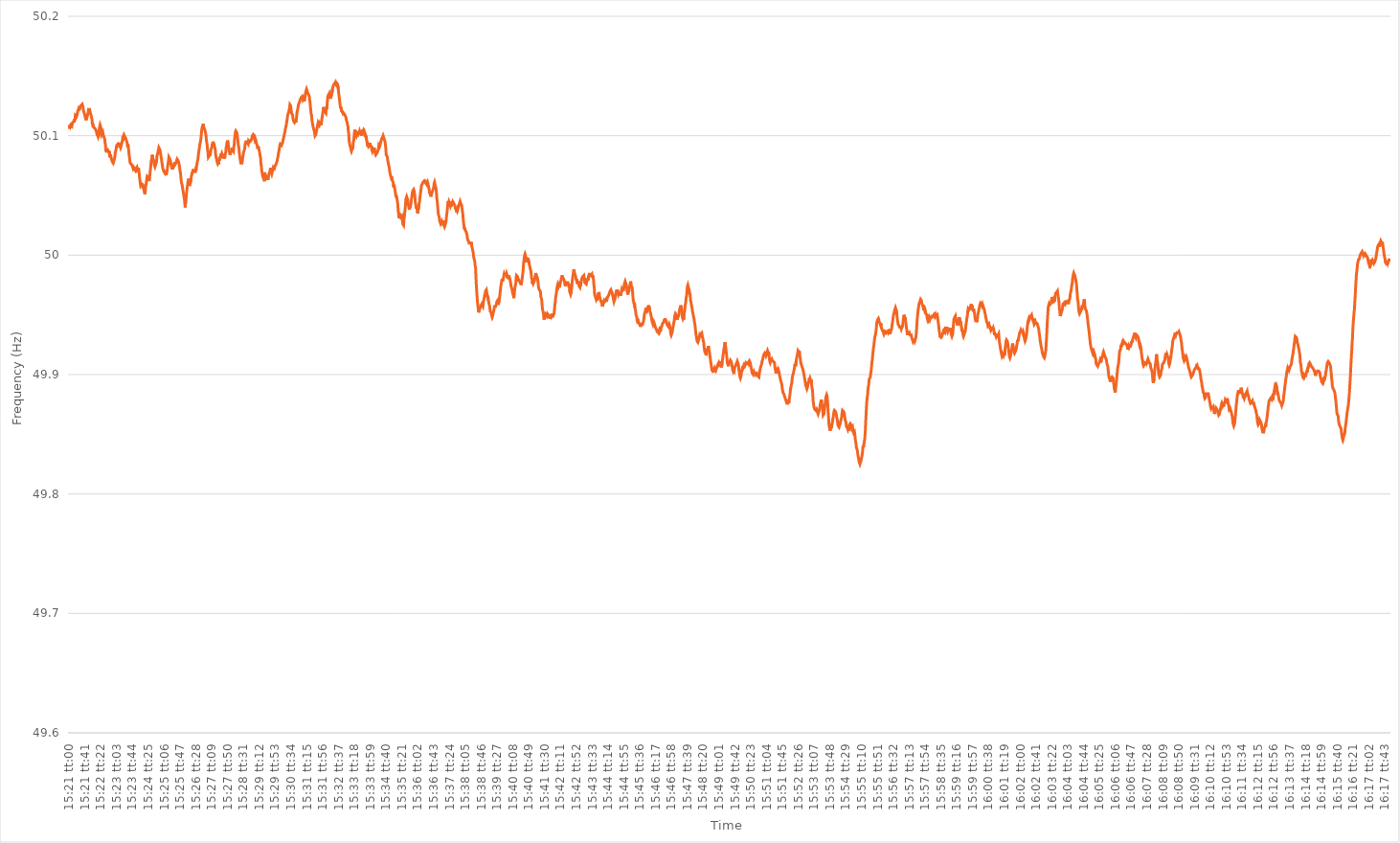
| Category | Series 0 |
|---|---|
| 0.6395833333333333 | 50.107 |
| 0.6395949074074074 | 50.106 |
| 0.6396064814814815 | 50.109 |
| 0.6396180555555556 | 50.108 |
| 0.6396296296296297 | 50.109 |
| 0.6396412037037037 | 50.109 |
| 0.6396527777777777 | 50.109 |
| 0.6396643518518519 | 50.108 |
| 0.6396759259259259 | 50.11 |
| 0.6396875 | 50.111 |
| 0.6396990740740741 | 50.111 |
| 0.6397106481481482 | 50.111 |
| 0.6397222222222222 | 50.112 |
| 0.6397337962962962 | 50.111 |
| 0.6397453703703704 | 50.114 |
| 0.6397569444444444 | 50.113 |
| 0.6397685185185186 | 50.117 |
| 0.6397800925925926 | 50.117 |
| 0.6397916666666666 | 50.117 |
| 0.6398032407407407 | 50.116 |
| 0.6398148148148148 | 50.117 |
| 0.6398263888888889 | 50.117 |
| 0.639837962962963 | 50.12 |
| 0.6398495370370371 | 50.121 |
| 0.6398611111111111 | 50.122 |
| 0.6398726851851851 | 50.121 |
| 0.6398842592592593 | 50.123 |
| 0.6398958333333333 | 50.122 |
| 0.6399074074074074 | 50.124 |
| 0.6399189814814815 | 50.124 |
| 0.6399305555555556 | 50.125 |
| 0.6399421296296296 | 50.125 |
| 0.6399537037037036 | 50.125 |
| 0.6399652777777778 | 50.126 |
| 0.6399768518518518 | 50.124 |
| 0.639988425925926 | 50.125 |
| 0.64 | 50.124 |
| 0.640011574074074 | 50.121 |
| 0.6400231481481481 | 50.121 |
| 0.6400347222222222 | 50.119 |
| 0.6400462962962963 | 50.118 |
| 0.6400578703703704 | 50.118 |
| 0.6400694444444445 | 50.115 |
| 0.6400810185185185 | 50.114 |
| 0.6400925925925925 | 50.113 |
| 0.6401041666666667 | 50.115 |
| 0.6401157407407407 | 50.115 |
| 0.6401273148148149 | 50.116 |
| 0.6401388888888889 | 50.118 |
| 0.640150462962963 | 50.119 |
| 0.640162037037037 | 50.122 |
| 0.640173611111111 | 50.122 |
| 0.6401851851851852 | 50.122 |
| 0.6401967592592592 | 50.122 |
| 0.6402083333333334 | 50.12 |
| 0.6402199074074074 | 50.12 |
| 0.6402314814814815 | 50.118 |
| 0.6402430555555555 | 50.117 |
| 0.6402546296296296 | 50.115 |
| 0.6402662037037037 | 50.114 |
| 0.6402777777777778 | 50.11 |
| 0.6402893518518519 | 50.109 |
| 0.6403009259259259 | 50.107 |
| 0.6403125 | 50.108 |
| 0.6403240740740741 | 50.107 |
| 0.6403356481481481 | 50.107 |
| 0.6403472222222223 | 50.107 |
| 0.6403587962962963 | 50.106 |
| 0.6403703703703704 | 50.106 |
| 0.6403819444444444 | 50.106 |
| 0.6403935185185184 | 50.104 |
| 0.6404050925925926 | 50.103 |
| 0.6404166666666666 | 50.101 |
| 0.6404282407407408 | 50.101 |
| 0.6404398148148148 | 50.1 |
| 0.6404513888888889 | 50.099 |
| 0.6404629629629629 | 50.1 |
| 0.640474537037037 | 50.101 |
| 0.6404861111111111 | 50.106 |
| 0.6404976851851852 | 50.106 |
| 0.6405092592592593 | 50.109 |
| 0.6405208333333333 | 50.108 |
| 0.6405324074074074 | 50.107 |
| 0.6405439814814815 | 50.104 |
| 0.6405555555555555 | 50.101 |
| 0.6405671296296297 | 50.101 |
| 0.6405787037037037 | 50.101 |
| 0.6405902777777778 | 50.103 |
| 0.6406018518518518 | 50.101 |
| 0.640613425925926 | 50.1 |
| 0.640625 | 50.099 |
| 0.640636574074074 | 50.098 |
| 0.6406481481481482 | 50.097 |
| 0.6406597222222222 | 50.094 |
| 0.6406712962962963 | 50.092 |
| 0.6406828703703703 | 50.087 |
| 0.6406944444444445 | 50.088 |
| 0.6407060185185185 | 50.086 |
| 0.6407175925925926 | 50.087 |
| 0.6407291666666667 | 50.087 |
| 0.6407407407407407 | 50.088 |
| 0.6407523148148148 | 50.088 |
| 0.6407638888888889 | 50.087 |
| 0.640775462962963 | 50.086 |
| 0.6407870370370371 | 50.087 |
| 0.6407986111111111 | 50.087 |
| 0.6408101851851852 | 50.082 |
| 0.6408217592592592 | 50.084 |
| 0.6408333333333334 | 50.082 |
| 0.6408449074074074 | 50.082 |
| 0.6408564814814816 | 50.08 |
| 0.6408680555555556 | 50.08 |
| 0.6408796296296296 | 50.078 |
| 0.6408912037037037 | 50.078 |
| 0.6409027777777777 | 50.077 |
| 0.6409143518518519 | 50.078 |
| 0.6409259259259259 | 50.079 |
| 0.6409375 | 50.079 |
| 0.6409490740740741 | 50.082 |
| 0.6409606481481481 | 50.085 |
| 0.6409722222222222 | 50.087 |
| 0.6409837962962963 | 50.088 |
| 0.6409953703703704 | 50.09 |
| 0.6410069444444445 | 50.092 |
| 0.6410185185185185 | 50.092 |
| 0.6410300925925926 | 50.092 |
| 0.6410416666666666 | 50.093 |
| 0.6410532407407408 | 50.092 |
| 0.6410648148148148 | 50.094 |
| 0.641076388888889 | 50.093 |
| 0.641087962962963 | 50.092 |
| 0.641099537037037 | 50.09 |
| 0.6411111111111111 | 50.091 |
| 0.6411226851851851 | 50.09 |
| 0.6411342592592593 | 50.09 |
| 0.6411458333333333 | 50.092 |
| 0.6411574074074075 | 50.092 |
| 0.6411689814814815 | 50.095 |
| 0.6411805555555555 | 50.096 |
| 0.6411921296296296 | 50.1 |
| 0.6412037037037037 | 50.099 |
| 0.6412152777777778 | 50.1 |
| 0.6412268518518519 | 50.099 |
| 0.641238425925926 | 50.1 |
| 0.64125 | 50.1 |
| 0.641261574074074 | 50.1 |
| 0.6412731481481482 | 50.098 |
| 0.6412847222222222 | 50.097 |
| 0.6412962962962964 | 50.096 |
| 0.6413078703703704 | 50.095 |
| 0.6413194444444444 | 50.094 |
| 0.6413310185185185 | 50.091 |
| 0.6413425925925926 | 50.093 |
| 0.6413541666666667 | 50.09 |
| 0.6413657407407407 | 50.088 |
| 0.6413773148148149 | 50.084 |
| 0.6413888888888889 | 50.082 |
| 0.6414004629629629 | 50.079 |
| 0.641412037037037 | 50.077 |
| 0.6414236111111111 | 50.077 |
| 0.6414351851851852 | 50.077 |
| 0.6414467592592593 | 50.076 |
| 0.6414583333333334 | 50.076 |
| 0.6414699074074074 | 50.075 |
| 0.6414814814814814 | 50.075 |
| 0.6414930555555556 | 50.073 |
| 0.6415046296296296 | 50.074 |
| 0.6415162037037038 | 50.074 |
| 0.6415277777777778 | 50.073 |
| 0.6415393518518518 | 50.072 |
| 0.6415509259259259 | 50.072 |
| 0.6415625 | 50.071 |
| 0.6415740740740741 | 50.072 |
| 0.6415856481481481 | 50.072 |
| 0.6415972222222223 | 50.073 |
| 0.6416087962962963 | 50.072 |
| 0.6416203703703703 | 50.073 |
| 0.6416319444444444 | 50.072 |
| 0.6416435185185185 | 50.072 |
| 0.6416550925925926 | 50.072 |
| 0.6416666666666667 | 50.072 |
| 0.6416782407407408 | 50.069 |
| 0.6416898148148148 | 50.065 |
| 0.6417013888888888 | 50.063 |
| 0.641712962962963 | 50.06 |
| 0.641724537037037 | 50.058 |
| 0.6417361111111112 | 50.058 |
| 0.6417476851851852 | 50.059 |
| 0.6417592592592593 | 50.058 |
| 0.6417708333333333 | 50.06 |
| 0.6417824074074074 | 50.058 |
| 0.6417939814814815 | 50.059 |
| 0.6418055555555555 | 50.056 |
| 0.6418171296296297 | 50.055 |
| 0.6418287037037037 | 50.054 |
| 0.6418402777777777 | 50.052 |
| 0.6418518518518518 | 50.051 |
| 0.6418634259259259 | 50.054 |
| 0.641875 | 50.058 |
| 0.6418865740740741 | 50.059 |
| 0.6418981481481482 | 50.062 |
| 0.6419097222222222 | 50.064 |
| 0.6419212962962962 | 50.066 |
| 0.6419328703703704 | 50.066 |
| 0.6419444444444444 | 50.066 |
| 0.6419560185185186 | 50.065 |
| 0.6419675925925926 | 50.063 |
| 0.6419791666666667 | 50.062 |
| 0.6419907407407407 | 50.065 |
| 0.6420023148148148 | 50.068 |
| 0.6420138888888889 | 50.071 |
| 0.642025462962963 | 50.074 |
| 0.6420370370370371 | 50.078 |
| 0.6420486111111111 | 50.08 |
| 0.6420601851851852 | 50.081 |
| 0.6420717592592592 | 50.084 |
| 0.6420833333333333 | 50.081 |
| 0.6420949074074074 | 50.081 |
| 0.6421064814814815 | 50.08 |
| 0.6421180555555556 | 50.08 |
| 0.6421296296296296 | 50.076 |
| 0.6421412037037036 | 50.075 |
| 0.6421527777777778 | 50.074 |
| 0.6421643518518518 | 50.074 |
| 0.642175925925926 | 50.074 |
| 0.6421875 | 50.077 |
| 0.6421990740740741 | 50.078 |
| 0.6422106481481481 | 50.083 |
| 0.6422222222222222 | 50.084 |
| 0.6422337962962963 | 50.085 |
| 0.6422453703703704 | 50.087 |
| 0.6422569444444445 | 50.088 |
| 0.6422685185185185 | 50.09 |
| 0.6422800925925926 | 50.09 |
| 0.6422916666666666 | 50.09 |
| 0.6423032407407407 | 50.088 |
| 0.6423148148148148 | 50.086 |
| 0.6423263888888889 | 50.086 |
| 0.642337962962963 | 50.082 |
| 0.642349537037037 | 50.08 |
| 0.642361111111111 | 50.077 |
| 0.6423726851851852 | 50.076 |
| 0.6423842592592592 | 50.073 |
| 0.6423958333333334 | 50.072 |
| 0.6424074074074074 | 50.071 |
| 0.6424189814814815 | 50.07 |
| 0.6424305555555555 | 50.07 |
| 0.6424421296296297 | 50.069 |
| 0.6424537037037037 | 50.071 |
| 0.6424652777777778 | 50.069 |
| 0.6424768518518519 | 50.068 |
| 0.6424884259259259 | 50.067 |
| 0.6425 | 50.069 |
| 0.642511574074074 | 50.07 |
| 0.6425231481481481 | 50.072 |
| 0.6425347222222222 | 50.075 |
| 0.6425462962962963 | 50.077 |
| 0.6425578703703704 | 50.079 |
| 0.6425694444444444 | 50.082 |
| 0.6425810185185185 | 50.082 |
| 0.6425925925925926 | 50.082 |
| 0.6426041666666666 | 50.08 |
| 0.6426157407407408 | 50.079 |
| 0.6426273148148148 | 50.077 |
| 0.6426388888888889 | 50.075 |
| 0.6426504629629629 | 50.074 |
| 0.6426620370370371 | 50.072 |
| 0.6426736111111111 | 50.074 |
| 0.6426851851851852 | 50.072 |
| 0.6426967592592593 | 50.075 |
| 0.6427083333333333 | 50.074 |
| 0.6427199074074074 | 50.076 |
| 0.6427314814814815 | 50.075 |
| 0.6427430555555556 | 50.078 |
| 0.6427546296296297 | 50.076 |
| 0.6427662037037037 | 50.076 |
| 0.6427777777777778 | 50.077 |
| 0.6427893518518518 | 50.078 |
| 0.6428009259259259 | 50.079 |
| 0.6428125 | 50.078 |
| 0.642824074074074 | 50.08 |
| 0.6428356481481482 | 50.08 |
| 0.6428472222222222 | 50.079 |
| 0.6428587962962963 | 50.078 |
| 0.6428703703703703 | 50.078 |
| 0.6428819444444445 | 50.075 |
| 0.6428935185185185 | 50.075 |
| 0.6429050925925927 | 50.07 |
| 0.6429166666666667 | 50.069 |
| 0.6429282407407407 | 50.065 |
| 0.6429398148148148 | 50.062 |
| 0.6429513888888889 | 50.06 |
| 0.642962962962963 | 50.059 |
| 0.6429745370370371 | 50.057 |
| 0.6429861111111111 | 50.055 |
| 0.6429976851851852 | 50.055 |
| 0.6430092592592592 | 50.051 |
| 0.6430208333333333 | 50.051 |
| 0.6430324074074074 | 50.047 |
| 0.6430439814814815 | 50.044 |
| 0.6430555555555556 | 50.04 |
| 0.6430671296296296 | 50.044 |
| 0.6430787037037037 | 50.045 |
| 0.6430902777777777 | 50.05 |
| 0.6431018518518519 | 50.053 |
| 0.6431134259259259 | 50.056 |
| 0.6431250000000001 | 50.058 |
| 0.6431365740740741 | 50.061 |
| 0.6431481481481481 | 50.062 |
| 0.6431597222222222 | 50.064 |
| 0.6431712962962963 | 50.06 |
| 0.6431828703703704 | 50.058 |
| 0.6431944444444445 | 50.059 |
| 0.6432060185185186 | 50.059 |
| 0.6432175925925926 | 50.061 |
| 0.6432291666666666 | 50.062 |
| 0.6432407407407407 | 50.066 |
| 0.6432523148148148 | 50.067 |
| 0.6432638888888889 | 50.069 |
| 0.643275462962963 | 50.069 |
| 0.643287037037037 | 50.07 |
| 0.6432986111111111 | 50.072 |
| 0.6433101851851851 | 50.07 |
| 0.6433217592592593 | 50.07 |
| 0.6433333333333333 | 50.07 |
| 0.6433449074074075 | 50.07 |
| 0.6433564814814815 | 50.069 |
| 0.6433680555555555 | 50.072 |
| 0.6433796296296296 | 50.071 |
| 0.6433912037037037 | 50.074 |
| 0.6434027777777778 | 50.075 |
| 0.6434143518518519 | 50.077 |
| 0.643425925925926 | 50.079 |
| 0.6434375 | 50.08 |
| 0.643449074074074 | 50.083 |
| 0.6434606481481482 | 50.086 |
| 0.6434722222222222 | 50.088 |
| 0.6434837962962963 | 50.09 |
| 0.6434953703703704 | 50.093 |
| 0.6435069444444445 | 50.094 |
| 0.6435185185185185 | 50.096 |
| 0.6435300925925925 | 50.098 |
| 0.6435416666666667 | 50.102 |
| 0.6435532407407407 | 50.105 |
| 0.6435648148148149 | 50.107 |
| 0.6435763888888889 | 50.108 |
| 0.643587962962963 | 50.109 |
| 0.643599537037037 | 50.11 |
| 0.6436111111111111 | 50.107 |
| 0.6436226851851852 | 50.107 |
| 0.6436342592592593 | 50.107 |
| 0.6436458333333334 | 50.105 |
| 0.6436574074074074 | 50.103 |
| 0.6436689814814814 | 50.102 |
| 0.6436805555555556 | 50.1 |
| 0.6436921296296296 | 50.096 |
| 0.6437037037037037 | 50.094 |
| 0.6437152777777778 | 50.092 |
| 0.6437268518518519 | 50.088 |
| 0.6437384259259259 | 50.086 |
| 0.6437499999999999 | 50.082 |
| 0.6437615740740741 | 50.082 |
| 0.6437731481481481 | 50.083 |
| 0.6437847222222223 | 50.083 |
| 0.6437962962962963 | 50.083 |
| 0.6438078703703703 | 50.084 |
| 0.6438194444444444 | 50.087 |
| 0.6438310185185185 | 50.089 |
| 0.6438425925925926 | 50.089 |
| 0.6438541666666667 | 50.09 |
| 0.6438657407407408 | 50.093 |
| 0.6438773148148148 | 50.092 |
| 0.6438888888888888 | 50.095 |
| 0.643900462962963 | 50.094 |
| 0.643912037037037 | 50.094 |
| 0.6439236111111112 | 50.093 |
| 0.6439351851851852 | 50.091 |
| 0.6439467592592593 | 50.09 |
| 0.6439583333333333 | 50.088 |
| 0.6439699074074073 | 50.084 |
| 0.6439814814814815 | 50.082 |
| 0.6439930555555555 | 50.081 |
| 0.6440046296296297 | 50.079 |
| 0.6440162037037037 | 50.079 |
| 0.6440277777777778 | 50.077 |
| 0.6440393518518518 | 50.078 |
| 0.6440509259259259 | 50.076 |
| 0.6440625 | 50.08 |
| 0.6440740740740741 | 50.079 |
| 0.6440856481481482 | 50.081 |
| 0.6440972222222222 | 50.082 |
| 0.6441087962962962 | 50.082 |
| 0.6441203703703704 | 50.083 |
| 0.6441319444444444 | 50.085 |
| 0.6441435185185186 | 50.084 |
| 0.6441550925925926 | 50.085 |
| 0.6441666666666667 | 50.084 |
| 0.6441782407407407 | 50.083 |
| 0.6441898148148147 | 50.082 |
| 0.6442013888888889 | 50.084 |
| 0.6442129629629629 | 50.081 |
| 0.6442245370370371 | 50.082 |
| 0.6442361111111111 | 50.081 |
| 0.6442476851851852 | 50.083 |
| 0.6442592592592592 | 50.085 |
| 0.6442708333333333 | 50.086 |
| 0.6442824074074074 | 50.09 |
| 0.6442939814814815 | 50.091 |
| 0.6443055555555556 | 50.094 |
| 0.6443171296296296 | 50.094 |
| 0.6443287037037037 | 50.096 |
| 0.6443402777777778 | 50.093 |
| 0.6443518518518518 | 50.092 |
| 0.644363425925926 | 50.088 |
| 0.644375 | 50.087 |
| 0.6443865740740741 | 50.086 |
| 0.6443981481481481 | 50.084 |
| 0.6444097222222221 | 50.085 |
| 0.6444212962962963 | 50.086 |
| 0.6444328703703703 | 50.086 |
| 0.6444444444444445 | 50.087 |
| 0.6444560185185185 | 50.09 |
| 0.6444675925925926 | 50.09 |
| 0.6444791666666666 | 50.088 |
| 0.6444907407407408 | 50.088 |
| 0.6445023148148148 | 50.087 |
| 0.6445138888888889 | 50.091 |
| 0.644525462962963 | 50.093 |
| 0.644537037037037 | 50.098 |
| 0.6445486111111111 | 50.1 |
| 0.6445601851851852 | 50.103 |
| 0.6445717592592592 | 50.104 |
| 0.6445833333333334 | 50.104 |
| 0.6445949074074074 | 50.103 |
| 0.6446064814814815 | 50.102 |
| 0.6446180555555555 | 50.1 |
| 0.6446296296296297 | 50.097 |
| 0.6446412037037037 | 50.094 |
| 0.6446527777777779 | 50.091 |
| 0.6446643518518519 | 50.09 |
| 0.6446759259259259 | 50.086 |
| 0.6446875 | 50.083 |
| 0.644699074074074 | 50.081 |
| 0.6447106481481482 | 50.079 |
| 0.6447222222222222 | 50.077 |
| 0.6447337962962963 | 50.077 |
| 0.6447453703703704 | 50.077 |
| 0.6447569444444444 | 50.077 |
| 0.6447685185185185 | 50.079 |
| 0.6447800925925926 | 50.082 |
| 0.6447916666666667 | 50.084 |
| 0.6448032407407408 | 50.086 |
| 0.6448148148148148 | 50.086 |
| 0.6448263888888889 | 50.088 |
| 0.6448379629629629 | 50.089 |
| 0.6448495370370371 | 50.093 |
| 0.6448611111111111 | 50.093 |
| 0.6448726851851853 | 50.095 |
| 0.6448842592592593 | 50.095 |
| 0.6448958333333333 | 50.095 |
| 0.6449074074074074 | 50.095 |
| 0.6449189814814814 | 50.094 |
| 0.6449305555555556 | 50.094 |
| 0.6449421296296296 | 50.093 |
| 0.6449537037037038 | 50.096 |
| 0.6449652777777778 | 50.096 |
| 0.6449768518518518 | 50.096 |
| 0.6449884259259259 | 50.095 |
| 0.645 | 50.095 |
| 0.6450115740740741 | 50.095 |
| 0.6450231481481482 | 50.096 |
| 0.6450347222222222 | 50.096 |
| 0.6450462962962963 | 50.097 |
| 0.6450578703703703 | 50.099 |
| 0.6450694444444445 | 50.1 |
| 0.6450810185185185 | 50.1 |
| 0.6450925925925927 | 50.101 |
| 0.6451041666666667 | 50.101 |
| 0.6451157407407407 | 50.1 |
| 0.6451273148148148 | 50.1 |
| 0.6451388888888888 | 50.097 |
| 0.645150462962963 | 50.098 |
| 0.645162037037037 | 50.097 |
| 0.6451736111111112 | 50.096 |
| 0.6451851851851852 | 50.094 |
| 0.6451967592592592 | 50.094 |
| 0.6452083333333333 | 50.092 |
| 0.6452199074074074 | 50.092 |
| 0.6452314814814815 | 50.089 |
| 0.6452430555555556 | 50.091 |
| 0.6452546296296297 | 50.09 |
| 0.6452662037037037 | 50.09 |
| 0.6452777777777777 | 50.087 |
| 0.6452893518518519 | 50.087 |
| 0.6453009259259259 | 50.083 |
| 0.6453125000000001 | 50.082 |
| 0.6453240740740741 | 50.076 |
| 0.6453356481481481 | 50.075 |
| 0.6453472222222222 | 50.071 |
| 0.6453587962962963 | 50.069 |
| 0.6453703703703704 | 50.067 |
| 0.6453819444444444 | 50.066 |
| 0.6453935185185186 | 50.065 |
| 0.6454050925925926 | 50.066 |
| 0.6454166666666666 | 50.065 |
| 0.6454282407407407 | 50.066 |
| 0.6454398148148148 | 50.065 |
| 0.6454513888888889 | 50.066 |
| 0.645462962962963 | 50.065 |
| 0.645474537037037 | 50.066 |
| 0.6454861111111111 | 50.065 |
| 0.6454976851851851 | 50.065 |
| 0.6455092592592593 | 50.065 |
| 0.6455208333333333 | 50.064 |
| 0.6455324074074075 | 50.063 |
| 0.6455439814814815 | 50.065 |
| 0.6455555555555555 | 50.065 |
| 0.6455671296296296 | 50.068 |
| 0.6455787037037037 | 50.068 |
| 0.6455902777777778 | 50.07 |
| 0.6456018518518518 | 50.07 |
| 0.645613425925926 | 50.073 |
| 0.645625 | 50.071 |
| 0.645636574074074 | 50.069 |
| 0.6456481481481481 | 50.068 |
| 0.6456597222222222 | 50.068 |
| 0.6456712962962963 | 50.068 |
| 0.6456828703703704 | 50.072 |
| 0.6456944444444445 | 50.071 |
| 0.6457060185185185 | 50.073 |
| 0.6457175925925925 | 50.072 |
| 0.6457291666666667 | 50.075 |
| 0.6457407407407407 | 50.074 |
| 0.6457523148148149 | 50.075 |
| 0.6457638888888889 | 50.075 |
| 0.645775462962963 | 50.076 |
| 0.645787037037037 | 50.076 |
| 0.6457986111111111 | 50.078 |
| 0.6458101851851852 | 50.079 |
| 0.6458217592592593 | 50.081 |
| 0.6458333333333334 | 50.082 |
| 0.6458449074074074 | 50.085 |
| 0.6458564814814814 | 50.086 |
| 0.6458680555555555 | 50.088 |
| 0.6458796296296296 | 50.09 |
| 0.6458912037037037 | 50.092 |
| 0.6459027777777778 | 50.093 |
| 0.6459143518518519 | 50.093 |
| 0.6459259259259259 | 50.093 |
| 0.6459374999999999 | 50.092 |
| 0.6459490740740741 | 50.093 |
| 0.6459606481481481 | 50.093 |
| 0.6459722222222223 | 50.094 |
| 0.6459837962962963 | 50.096 |
| 0.6459953703703704 | 50.097 |
| 0.6460069444444444 | 50.099 |
| 0.6460185185185185 | 50.1 |
| 0.6460300925925926 | 50.102 |
| 0.6460416666666667 | 50.103 |
| 0.6460532407407408 | 50.105 |
| 0.6460648148148148 | 50.107 |
| 0.6460763888888889 | 50.108 |
| 0.6460879629629629 | 50.11 |
| 0.646099537037037 | 50.112 |
| 0.6461111111111111 | 50.114 |
| 0.6461226851851852 | 50.117 |
| 0.6461342592592593 | 50.117 |
| 0.6461458333333333 | 50.119 |
| 0.6461574074074073 | 50.12 |
| 0.6461689814814815 | 50.122 |
| 0.6461805555555555 | 50.123 |
| 0.6461921296296297 | 50.126 |
| 0.6462037037037037 | 50.126 |
| 0.6462152777777778 | 50.125 |
| 0.6462268518518518 | 50.122 |
| 0.646238425925926 | 50.119 |
| 0.64625 | 50.119 |
| 0.6462615740740741 | 50.118 |
| 0.6462731481481482 | 50.117 |
| 0.6462847222222222 | 50.114 |
| 0.6462962962962963 | 50.114 |
| 0.6463078703703703 | 50.112 |
| 0.6463194444444444 | 50.112 |
| 0.6463310185185185 | 50.111 |
| 0.6463425925925926 | 50.111 |
| 0.6463541666666667 | 50.112 |
| 0.6463657407407407 | 50.111 |
| 0.6463773148148148 | 50.113 |
| 0.6463888888888889 | 50.115 |
| 0.6464004629629629 | 50.119 |
| 0.6464120370370371 | 50.119 |
| 0.6464236111111111 | 50.122 |
| 0.6464351851851852 | 50.124 |
| 0.6464467592592592 | 50.126 |
| 0.6464583333333334 | 50.127 |
| 0.6464699074074074 | 50.127 |
| 0.6464814814814815 | 50.128 |
| 0.6464930555555556 | 50.13 |
| 0.6465046296296296 | 50.13 |
| 0.6465162037037037 | 50.131 |
| 0.6465277777777778 | 50.132 |
| 0.6465393518518519 | 50.132 |
| 0.646550925925926 | 50.132 |
| 0.6465625 | 50.133 |
| 0.6465740740740741 | 50.132 |
| 0.6465856481481481 | 50.13 |
| 0.6465972222222222 | 50.13 |
| 0.6466087962962963 | 50.131 |
| 0.6466203703703703 | 50.129 |
| 0.6466319444444445 | 50.13 |
| 0.6466435185185185 | 50.132 |
| 0.6466550925925926 | 50.135 |
| 0.6466666666666666 | 50.137 |
| 0.6466782407407408 | 50.138 |
| 0.6466898148148148 | 50.139 |
| 0.646701388888889 | 50.138 |
| 0.646712962962963 | 50.138 |
| 0.646724537037037 | 50.136 |
| 0.6467361111111111 | 50.135 |
| 0.6467476851851852 | 50.135 |
| 0.6467592592592593 | 50.134 |
| 0.6467708333333334 | 50.133 |
| 0.6467824074074074 | 50.13 |
| 0.6467939814814815 | 50.128 |
| 0.6468055555555555 | 50.124 |
| 0.6468171296296296 | 50.121 |
| 0.6468287037037037 | 50.118 |
| 0.6468402777777778 | 50.117 |
| 0.6468518518518519 | 50.113 |
| 0.6468634259259259 | 50.111 |
| 0.646875 | 50.109 |
| 0.646886574074074 | 50.109 |
| 0.6468981481481482 | 50.106 |
| 0.6469097222222222 | 50.106 |
| 0.6469212962962964 | 50.104 |
| 0.6469328703703704 | 50.102 |
| 0.6469444444444444 | 50.1 |
| 0.6469560185185185 | 50.1 |
| 0.6469675925925926 | 50.101 |
| 0.6469791666666667 | 50.103 |
| 0.6469907407407408 | 50.103 |
| 0.6470023148148148 | 50.106 |
| 0.6470138888888889 | 50.108 |
| 0.6470254629629629 | 50.108 |
| 0.647037037037037 | 50.111 |
| 0.6470486111111111 | 50.111 |
| 0.6470601851851852 | 50.111 |
| 0.6470717592592593 | 50.109 |
| 0.6470833333333333 | 50.11 |
| 0.6470949074074074 | 50.109 |
| 0.6471064814814814 | 50.111 |
| 0.6471180555555556 | 50.109 |
| 0.6471296296296296 | 50.11 |
| 0.6471412037037038 | 50.112 |
| 0.6471527777777778 | 50.115 |
| 0.6471643518518518 | 50.117 |
| 0.6471759259259259 | 50.119 |
| 0.6471875 | 50.121 |
| 0.6471990740740741 | 50.124 |
| 0.6472106481481482 | 50.122 |
| 0.6472222222222223 | 50.122 |
| 0.6472337962962963 | 50.121 |
| 0.6472453703703703 | 50.12 |
| 0.6472569444444444 | 50.12 |
| 0.6472685185185185 | 50.119 |
| 0.6472800925925926 | 50.123 |
| 0.6472916666666667 | 50.122 |
| 0.6473032407407407 | 50.125 |
| 0.6473148148148148 | 50.129 |
| 0.6473263888888888 | 50.133 |
| 0.647337962962963 | 50.133 |
| 0.647349537037037 | 50.133 |
| 0.6473611111111112 | 50.135 |
| 0.6473726851851852 | 50.132 |
| 0.6473842592592592 | 50.131 |
| 0.6473958333333333 | 50.133 |
| 0.6474074074074074 | 50.131 |
| 0.6474189814814815 | 50.134 |
| 0.6474305555555556 | 50.133 |
| 0.6474421296296297 | 50.137 |
| 0.6474537037037037 | 50.136 |
| 0.6474652777777777 | 50.139 |
| 0.6474768518518519 | 50.139 |
| 0.6474884259259259 | 50.142 |
| 0.6475 | 50.142 |
| 0.6475115740740741 | 50.143 |
| 0.6475231481481482 | 50.143 |
| 0.6475347222222222 | 50.144 |
| 0.6475462962962962 | 50.144 |
| 0.6475578703703704 | 50.145 |
| 0.6475694444444444 | 50.144 |
| 0.6475810185185186 | 50.145 |
| 0.6475925925925926 | 50.142 |
| 0.6476041666666666 | 50.144 |
| 0.6476157407407407 | 50.141 |
| 0.6476273148148148 | 50.142 |
| 0.6476388888888889 | 50.139 |
| 0.647650462962963 | 50.136 |
| 0.6476620370370371 | 50.136 |
| 0.6476736111111111 | 50.131 |
| 0.6476851851851851 | 50.128 |
| 0.6476967592592593 | 50.125 |
| 0.6477083333333333 | 50.123 |
| 0.6477199074074075 | 50.124 |
| 0.6477314814814815 | 50.122 |
| 0.6477430555555556 | 50.12 |
| 0.6477546296296296 | 50.121 |
| 0.6477662037037036 | 50.119 |
| 0.6477777777777778 | 50.12 |
| 0.6477893518518518 | 50.118 |
| 0.647800925925926 | 50.118 |
| 0.6478125 | 50.118 |
| 0.647824074074074 | 50.118 |
| 0.6478356481481481 | 50.118 |
| 0.6478472222222222 | 50.118 |
| 0.6478587962962963 | 50.116 |
| 0.6478703703703704 | 50.115 |
| 0.6478819444444445 | 50.113 |
| 0.6478935185185185 | 50.112 |
| 0.6479050925925925 | 50.111 |
| 0.6479166666666667 | 50.109 |
| 0.6479282407407407 | 50.108 |
| 0.6479398148148149 | 50.104 |
| 0.6479513888888889 | 50.102 |
| 0.647962962962963 | 50.096 |
| 0.647974537037037 | 50.094 |
| 0.647986111111111 | 50.092 |
| 0.6479976851851852 | 50.091 |
| 0.6480092592592592 | 50.09 |
| 0.6480208333333334 | 50.088 |
| 0.6480324074074074 | 50.087 |
| 0.6480439814814815 | 50.088 |
| 0.6480555555555555 | 50.088 |
| 0.6480671296296296 | 50.089 |
| 0.6480787037037037 | 50.091 |
| 0.6480902777777778 | 50.095 |
| 0.6481018518518519 | 50.096 |
| 0.6481134259259259 | 50.099 |
| 0.648125 | 50.103 |
| 0.6481365740740741 | 50.105 |
| 0.6481481481481481 | 50.103 |
| 0.6481597222222223 | 50.104 |
| 0.6481712962962963 | 50.101 |
| 0.6481828703703704 | 50.1 |
| 0.6481944444444444 | 50.1 |
| 0.6482060185185184 | 50.102 |
| 0.6482175925925926 | 50.102 |
| 0.6482291666666666 | 50.101 |
| 0.6482407407407408 | 50.102 |
| 0.6482523148148148 | 50.102 |
| 0.6482638888888889 | 50.103 |
| 0.6482754629629629 | 50.104 |
| 0.648287037037037 | 50.104 |
| 0.6482986111111111 | 50.102 |
| 0.6483101851851852 | 50.102 |
| 0.6483217592592593 | 50.101 |
| 0.6483333333333333 | 50.1 |
| 0.6483449074074074 | 50.103 |
| 0.6483564814814815 | 50.103 |
| 0.6483680555555555 | 50.105 |
| 0.6483796296296297 | 50.103 |
| 0.6483912037037037 | 50.104 |
| 0.6484027777777778 | 50.103 |
| 0.6484143518518518 | 50.102 |
| 0.648425925925926 | 50.103 |
| 0.6484375 | 50.102 |
| 0.648449074074074 | 50.101 |
| 0.6484606481481482 | 50.099 |
| 0.6484722222222222 | 50.1 |
| 0.6484837962962963 | 50.097 |
| 0.6484953703703703 | 50.095 |
| 0.6485069444444445 | 50.095 |
| 0.6485185185185185 | 50.091 |
| 0.6485300925925926 | 50.092 |
| 0.6485416666666667 | 50.091 |
| 0.6485532407407407 | 50.091 |
| 0.6485648148148148 | 50.092 |
| 0.6485763888888889 | 50.091 |
| 0.648587962962963 | 50.094 |
| 0.6485995370370371 | 50.092 |
| 0.6486111111111111 | 50.092 |
| 0.6486226851851852 | 50.091 |
| 0.6486342592592592 | 50.091 |
| 0.6486458333333334 | 50.088 |
| 0.6486574074074074 | 50.087 |
| 0.6486689814814816 | 50.088 |
| 0.6486805555555556 | 50.089 |
| 0.6486921296296296 | 50.089 |
| 0.6487037037037037 | 50.088 |
| 0.6487152777777777 | 50.09 |
| 0.6487268518518519 | 50.088 |
| 0.6487384259259259 | 50.088 |
| 0.64875 | 50.085 |
| 0.6487615740740741 | 50.084 |
| 0.6487731481481481 | 50.084 |
| 0.6487847222222222 | 50.085 |
| 0.6487962962962963 | 50.085 |
| 0.6488078703703704 | 50.086 |
| 0.6488194444444445 | 50.087 |
| 0.6488310185185185 | 50.087 |
| 0.6488425925925926 | 50.089 |
| 0.6488541666666666 | 50.092 |
| 0.6488657407407408 | 50.092 |
| 0.6488773148148148 | 50.091 |
| 0.648888888888889 | 50.092 |
| 0.648900462962963 | 50.092 |
| 0.648912037037037 | 50.095 |
| 0.6489236111111111 | 50.095 |
| 0.6489351851851851 | 50.097 |
| 0.6489467592592593 | 50.098 |
| 0.6489583333333333 | 50.098 |
| 0.6489699074074075 | 50.099 |
| 0.6489814814814815 | 50.1 |
| 0.6489930555555555 | 50.1 |
| 0.6490046296296296 | 50.1 |
| 0.6490162037037037 | 50.097 |
| 0.6490277777777778 | 50.097 |
| 0.6490393518518519 | 50.095 |
| 0.649050925925926 | 50.092 |
| 0.6490625 | 50.089 |
| 0.649074074074074 | 50.084 |
| 0.6490856481481482 | 50.084 |
| 0.6490972222222222 | 50.083 |
| 0.6491087962962964 | 50.082 |
| 0.6491203703703704 | 50.079 |
| 0.6491319444444444 | 50.078 |
| 0.6491435185185185 | 50.076 |
| 0.6491550925925925 | 50.076 |
| 0.6491666666666667 | 50.073 |
| 0.6491782407407407 | 50.07 |
| 0.6491898148148149 | 50.07 |
| 0.6492013888888889 | 50.067 |
| 0.6492129629629629 | 50.067 |
| 0.649224537037037 | 50.065 |
| 0.6492361111111111 | 50.066 |
| 0.6492476851851852 | 50.063 |
| 0.6492592592592593 | 50.063 |
| 0.6492708333333334 | 50.062 |
| 0.6492824074074074 | 50.061 |
| 0.6492939814814814 | 50.057 |
| 0.6493055555555556 | 50.059 |
| 0.6493171296296296 | 50.057 |
| 0.6493287037037038 | 50.056 |
| 0.6493402777777778 | 50.054 |
| 0.6493518518518518 | 50.052 |
| 0.6493634259259259 | 50.049 |
| 0.649375 | 50.05 |
| 0.6493865740740741 | 50.048 |
| 0.6493981481481481 | 50.047 |
| 0.6494097222222223 | 50.045 |
| 0.6494212962962963 | 50.042 |
| 0.6494328703703703 | 50.037 |
| 0.6494444444444444 | 50.035 |
| 0.6494560185185185 | 50.031 |
| 0.6494675925925926 | 50.034 |
| 0.6494791666666667 | 50.032 |
| 0.6494907407407408 | 50.033 |
| 0.6495023148148148 | 50.032 |
| 0.6495138888888888 | 50.032 |
| 0.649525462962963 | 50.032 |
| 0.649537037037037 | 50.033 |
| 0.6495486111111112 | 50.03 |
| 0.6495601851851852 | 50.029 |
| 0.6495717592592593 | 50.026 |
| 0.6495833333333333 | 50.026 |
| 0.6495949074074074 | 50.025 |
| 0.6496064814814815 | 50.03 |
| 0.6496180555555556 | 50.032 |
| 0.6496296296296297 | 50.036 |
| 0.6496412037037037 | 50.039 |
| 0.6496527777777777 | 50.043 |
| 0.6496643518518518 | 50.047 |
| 0.6496759259259259 | 50.048 |
| 0.6496875 | 50.049 |
| 0.6496990740740741 | 50.049 |
| 0.6497106481481482 | 50.049 |
| 0.6497222222222222 | 50.046 |
| 0.6497337962962962 | 50.043 |
| 0.6497453703703704 | 50.041 |
| 0.6497569444444444 | 50.041 |
| 0.6497685185185186 | 50.038 |
| 0.6497800925925926 | 50.042 |
| 0.6497916666666667 | 50.04 |
| 0.6498032407407407 | 50.042 |
| 0.6498148148148148 | 50.043 |
| 0.6498263888888889 | 50.046 |
| 0.649837962962963 | 50.046 |
| 0.6498495370370371 | 50.051 |
| 0.6498611111111111 | 50.053 |
| 0.6498726851851852 | 50.054 |
| 0.6498842592592592 | 50.054 |
| 0.6498958333333333 | 50.055 |
| 0.6499074074074074 | 50.054 |
| 0.6499189814814815 | 50.052 |
| 0.6499305555555556 | 50.05 |
| 0.6499421296296296 | 50.045 |
| 0.6499537037037036 | 50.043 |
| 0.6499652777777778 | 50.041 |
| 0.6499768518518518 | 50.039 |
| 0.649988425925926 | 50.04 |
| 0.65 | 50.038 |
| 0.6500115740740741 | 50.035 |
| 0.6500231481481481 | 50.036 |
| 0.6500347222222222 | 50.038 |
| 0.6500462962962963 | 50.039 |
| 0.6500578703703704 | 50.043 |
| 0.6500694444444445 | 50.044 |
| 0.6500810185185185 | 50.048 |
| 0.6500925925925926 | 50.05 |
| 0.6501041666666666 | 50.053 |
| 0.6501157407407407 | 50.055 |
| 0.6501273148148148 | 50.058 |
| 0.6501388888888889 | 50.059 |
| 0.650150462962963 | 50.059 |
| 0.650162037037037 | 50.06 |
| 0.650173611111111 | 50.061 |
| 0.6501851851851852 | 50.061 |
| 0.6501967592592592 | 50.061 |
| 0.6502083333333334 | 50.062 |
| 0.6502199074074074 | 50.061 |
| 0.6502314814814815 | 50.063 |
| 0.6502430555555555 | 50.061 |
| 0.6502546296296297 | 50.061 |
| 0.6502662037037037 | 50.06 |
| 0.6502777777777778 | 50.06 |
| 0.6502893518518519 | 50.059 |
| 0.6503009259259259 | 50.059 |
| 0.6503125 | 50.061 |
| 0.6503240740740741 | 50.06 |
| 0.6503356481481481 | 50.058 |
| 0.6503472222222222 | 50.057 |
| 0.6503587962962963 | 50.055 |
| 0.6503703703703704 | 50.052 |
| 0.6503819444444444 | 50.053 |
| 0.6503935185185185 | 50.051 |
| 0.6504050925925926 | 50.049 |
| 0.6504166666666666 | 50.049 |
| 0.6504282407407408 | 50.051 |
| 0.6504398148148148 | 50.052 |
| 0.6504513888888889 | 50.053 |
| 0.6504629629629629 | 50.054 |
| 0.6504745370370371 | 50.054 |
| 0.6504861111111111 | 50.056 |
| 0.6504976851851852 | 50.057 |
| 0.6505092592592593 | 50.06 |
| 0.6505208333333333 | 50.061 |
| 0.6505324074074074 | 50.061 |
| 0.6505439814814815 | 50.058 |
| 0.6505555555555556 | 50.057 |
| 0.6505671296296297 | 50.055 |
| 0.6505787037037037 | 50.052 |
| 0.6505902777777778 | 50.047 |
| 0.6506018518518518 | 50.045 |
| 0.6506134259259259 | 50.041 |
| 0.650625 | 50.037 |
| 0.650636574074074 | 50.034 |
| 0.6506481481481482 | 50.033 |
| 0.6506597222222222 | 50.032 |
| 0.6506712962962963 | 50.029 |
| 0.6506828703703703 | 50.028 |
| 0.6506944444444445 | 50.027 |
| 0.6507060185185185 | 50.026 |
| 0.6507175925925927 | 50.026 |
| 0.6507291666666667 | 50.027 |
| 0.6507407407407407 | 50.028 |
| 0.6507523148148148 | 50.027 |
| 0.6507638888888889 | 50.027 |
| 0.650775462962963 | 50.026 |
| 0.6507870370370371 | 50.029 |
| 0.6507986111111111 | 50.026 |
| 0.6508101851851852 | 50.026 |
| 0.6508217592592592 | 50.024 |
| 0.6508333333333333 | 50.025 |
| 0.6508449074074074 | 50.025 |
| 0.6508564814814815 | 50.027 |
| 0.6508680555555556 | 50.029 |
| 0.6508796296296296 | 50.033 |
| 0.6508912037037037 | 50.035 |
| 0.6509027777777777 | 50.038 |
| 0.6509143518518519 | 50.042 |
| 0.6509259259259259 | 50.045 |
| 0.6509375000000001 | 50.044 |
| 0.6509490740740741 | 50.045 |
| 0.6509606481481481 | 50.044 |
| 0.6509722222222222 | 50.043 |
| 0.6509837962962963 | 50.042 |
| 0.6509953703703704 | 50.041 |
| 0.6510069444444445 | 50.042 |
| 0.6510185185185186 | 50.043 |
| 0.6510300925925926 | 50.041 |
| 0.6510416666666666 | 50.045 |
| 0.6510532407407407 | 50.044 |
| 0.6510648148148148 | 50.045 |
| 0.6510763888888889 | 50.045 |
| 0.651087962962963 | 50.044 |
| 0.651099537037037 | 50.043 |
| 0.6511111111111111 | 50.043 |
| 0.6511226851851851 | 50.042 |
| 0.6511342592592593 | 50.041 |
| 0.6511458333333333 | 50.039 |
| 0.6511574074074075 | 50.039 |
| 0.6511689814814815 | 50.038 |
| 0.6511805555555555 | 50.036 |
| 0.6511921296296296 | 50.038 |
| 0.6512037037037037 | 50.037 |
| 0.6512152777777778 | 50.038 |
| 0.6512268518518519 | 50.038 |
| 0.651238425925926 | 50.042 |
| 0.65125 | 50.041 |
| 0.651261574074074 | 50.043 |
| 0.6512731481481482 | 50.043 |
| 0.6512847222222222 | 50.045 |
| 0.6512962962962963 | 50.044 |
| 0.6513078703703704 | 50.043 |
| 0.6513194444444445 | 50.043 |
| 0.6513310185185185 | 50.042 |
| 0.6513425925925925 | 50.039 |
| 0.6513541666666667 | 50.037 |
| 0.6513657407407407 | 50.035 |
| 0.6513773148148149 | 50.031 |
| 0.6513888888888889 | 50.027 |
| 0.651400462962963 | 50.025 |
| 0.651412037037037 | 50.022 |
| 0.6514236111111111 | 50.023 |
| 0.6514351851851852 | 50.021 |
| 0.6514467592592593 | 50.021 |
| 0.6514583333333334 | 50.02 |
| 0.6514699074074074 | 50.019 |
| 0.6514814814814814 | 50.018 |
| 0.6514930555555556 | 50.017 |
| 0.6515046296296296 | 50.014 |
| 0.6515162037037037 | 50.014 |
| 0.6515277777777778 | 50.012 |
| 0.6515393518518519 | 50.012 |
| 0.6515509259259259 | 50.011 |
| 0.6515624999999999 | 50.009 |
| 0.6515740740740741 | 50.01 |
| 0.6515856481481481 | 50.01 |
| 0.6515972222222223 | 50.01 |
| 0.6516087962962963 | 50.01 |
| 0.6516203703703703 | 50.011 |
| 0.6516319444444444 | 50.008 |
| 0.6516435185185185 | 50.008 |
| 0.6516550925925926 | 50.005 |
| 0.6516666666666667 | 50.005 |
| 0.6516782407407408 | 50.002 |
| 0.6516898148148148 | 49.999 |
| 0.6517013888888888 | 49.997 |
| 0.651712962962963 | 49.996 |
| 0.651724537037037 | 49.995 |
| 0.6517361111111112 | 49.991 |
| 0.6517476851851852 | 49.99 |
| 0.6517592592592593 | 49.982 |
| 0.6517708333333333 | 49.975 |
| 0.6517824074074073 | 49.97 |
| 0.6517939814814815 | 49.965 |
| 0.6518055555555555 | 49.961 |
| 0.6518171296296297 | 49.958 |
| 0.6518287037037037 | 49.955 |
| 0.6518402777777778 | 49.952 |
| 0.6518518518518518 | 49.953 |
| 0.6518634259259259 | 49.954 |
| 0.651875 | 49.955 |
| 0.6518865740740741 | 49.955 |
| 0.6518981481481482 | 49.957 |
| 0.6519097222222222 | 49.957 |
| 0.6519212962962962 | 49.957 |
| 0.6519328703703704 | 49.959 |
| 0.6519444444444444 | 49.959 |
| 0.6519560185185186 | 49.959 |
| 0.6519675925925926 | 49.957 |
| 0.6519791666666667 | 49.959 |
| 0.6519907407407407 | 49.962 |
| 0.6520023148148147 | 49.962 |
| 0.6520138888888889 | 49.965 |
| 0.6520254629629629 | 49.967 |
| 0.6520370370370371 | 49.968 |
| 0.6520486111111111 | 49.97 |
| 0.6520601851851852 | 49.97 |
| 0.6520717592592592 | 49.971 |
| 0.6520833333333333 | 49.969 |
| 0.6520949074074074 | 49.969 |
| 0.6521064814814815 | 49.965 |
| 0.6521180555555556 | 49.966 |
| 0.6521296296296296 | 49.962 |
| 0.6521412037037037 | 49.961 |
| 0.6521527777777778 | 49.959 |
| 0.6521643518518518 | 49.958 |
| 0.652175925925926 | 49.956 |
| 0.6521875 | 49.953 |
| 0.6521990740740741 | 49.953 |
| 0.6522106481481481 | 49.952 |
| 0.6522222222222223 | 49.951 |
| 0.6522337962962963 | 49.949 |
| 0.6522453703703703 | 49.948 |
| 0.6522569444444445 | 49.949 |
| 0.6522685185185185 | 49.949 |
| 0.6522800925925926 | 49.952 |
| 0.6522916666666666 | 49.953 |
| 0.6523032407407408 | 49.955 |
| 0.6523148148148148 | 49.957 |
| 0.6523263888888889 | 49.957 |
| 0.652337962962963 | 49.957 |
| 0.652349537037037 | 49.957 |
| 0.6523611111111111 | 49.958 |
| 0.6523726851851852 | 49.959 |
| 0.6523842592592592 | 49.961 |
| 0.6523958333333334 | 49.961 |
| 0.6524074074074074 | 49.962 |
| 0.6524189814814815 | 49.961 |
| 0.6524305555555555 | 49.961 |
| 0.6524421296296297 | 49.96 |
| 0.6524537037037037 | 49.961 |
| 0.6524652777777777 | 49.964 |
| 0.6524768518518519 | 49.967 |
| 0.6524884259259259 | 49.97 |
| 0.6525 | 49.973 |
| 0.652511574074074 | 49.975 |
| 0.6525231481481482 | 49.977 |
| 0.6525347222222222 | 49.979 |
| 0.6525462962962963 | 49.979 |
| 0.6525578703703704 | 49.979 |
| 0.6525694444444444 | 49.979 |
| 0.6525810185185185 | 49.981 |
| 0.6525925925925926 | 49.981 |
| 0.6526041666666667 | 49.984 |
| 0.6526157407407408 | 49.983 |
| 0.6526273148148148 | 49.985 |
| 0.6526388888888889 | 49.983 |
| 0.6526504629629629 | 49.985 |
| 0.6526620370370371 | 49.984 |
| 0.6526736111111111 | 49.985 |
| 0.6526851851851853 | 49.984 |
| 0.6526967592592593 | 49.984 |
| 0.6527083333333333 | 49.982 |
| 0.6527199074074074 | 49.981 |
| 0.6527314814814814 | 49.98 |
| 0.6527430555555556 | 49.983 |
| 0.6527546296296296 | 49.982 |
| 0.6527662037037038 | 49.982 |
| 0.6527777777777778 | 49.98 |
| 0.6527893518518518 | 49.978 |
| 0.6528009259259259 | 49.976 |
| 0.6528125 | 49.974 |
| 0.6528240740740741 | 49.974 |
| 0.6528356481481482 | 49.972 |
| 0.6528472222222222 | 49.97 |
| 0.6528587962962963 | 49.97 |
| 0.6528703703703703 | 49.967 |
| 0.6528819444444445 | 49.966 |
| 0.6528935185185185 | 49.964 |
| 0.6529050925925927 | 49.968 |
| 0.6529166666666667 | 49.97 |
| 0.6529282407407407 | 49.973 |
| 0.6529398148148148 | 49.975 |
| 0.6529513888888888 | 49.976 |
| 0.652962962962963 | 49.981 |
| 0.652974537037037 | 49.983 |
| 0.6529861111111112 | 49.983 |
| 0.6529976851851852 | 49.983 |
| 0.6530092592592592 | 49.982 |
| 0.6530208333333333 | 49.978 |
| 0.6530324074074074 | 49.98 |
| 0.6530439814814815 | 49.979 |
| 0.6530555555555556 | 49.979 |
| 0.6530671296296297 | 49.978 |
| 0.6530787037037037 | 49.978 |
| 0.6530902777777777 | 49.978 |
| 0.6531018518518519 | 49.976 |
| 0.6531134259259259 | 49.975 |
| 0.6531250000000001 | 49.977 |
| 0.6531365740740741 | 49.979 |
| 0.6531481481481481 | 49.979 |
| 0.6531597222222222 | 49.984 |
| 0.6531712962962963 | 49.987 |
| 0.6531828703703704 | 49.992 |
| 0.6531944444444444 | 49.995 |
| 0.6532060185185186 | 49.998 |
| 0.6532175925925926 | 50 |
| 0.6532291666666666 | 50.001 |
| 0.6532407407407407 | 50 |
| 0.6532523148148148 | 49.998 |
| 0.6532638888888889 | 49.997 |
| 0.653275462962963 | 49.995 |
| 0.653287037037037 | 49.994 |
| 0.6532986111111111 | 49.998 |
| 0.6533101851851851 | 49.995 |
| 0.6533217592592593 | 49.997 |
| 0.6533333333333333 | 49.996 |
| 0.6533449074074075 | 49.995 |
| 0.6533564814814815 | 49.992 |
| 0.6533680555555555 | 49.991 |
| 0.6533796296296296 | 49.991 |
| 0.6533912037037037 | 49.988 |
| 0.6534027777777778 | 49.987 |
| 0.6534143518518518 | 49.984 |
| 0.653425925925926 | 49.981 |
| 0.6534375 | 49.98 |
| 0.653449074074074 | 49.976 |
| 0.6534606481481481 | 49.977 |
| 0.6534722222222222 | 49.976 |
| 0.6534837962962963 | 49.976 |
| 0.6534953703703704 | 49.976 |
| 0.6535069444444445 | 49.978 |
| 0.6535185185185185 | 49.978 |
| 0.6535300925925925 | 49.982 |
| 0.6535416666666667 | 49.982 |
| 0.6535532407407407 | 49.985 |
| 0.6535648148148149 | 49.983 |
| 0.6535763888888889 | 49.983 |
| 0.653587962962963 | 49.982 |
| 0.653599537037037 | 49.981 |
| 0.6536111111111111 | 49.979 |
| 0.6536226851851852 | 49.976 |
| 0.6536342592592593 | 49.973 |
| 0.6536458333333334 | 49.972 |
| 0.6536574074074074 | 49.971 |
| 0.6536689814814814 | 49.971 |
| 0.6536805555555555 | 49.97 |
| 0.6536921296296296 | 49.969 |
| 0.6537037037037037 | 49.965 |
| 0.6537152777777778 | 49.965 |
| 0.6537268518518519 | 49.963 |
| 0.6537384259259259 | 49.959 |
| 0.6537499999999999 | 49.955 |
| 0.6537615740740741 | 49.955 |
| 0.6537731481481481 | 49.952 |
| 0.6537847222222223 | 49.95 |
| 0.6537962962962963 | 49.946 |
| 0.6538078703703704 | 49.947 |
| 0.6538194444444444 | 49.948 |
| 0.6538310185185185 | 49.949 |
| 0.6538425925925926 | 49.948 |
| 0.6538541666666667 | 49.95 |
| 0.6538657407407408 | 49.95 |
| 0.6538773148148148 | 49.949 |
| 0.6538888888888889 | 49.95 |
| 0.6539004629629629 | 49.949 |
| 0.653912037037037 | 49.949 |
| 0.6539236111111111 | 49.95 |
| 0.6539351851851852 | 49.95 |
| 0.6539467592592593 | 49.949 |
| 0.6539583333333333 | 49.948 |
| 0.6539699074074073 | 49.947 |
| 0.6539814814814815 | 49.949 |
| 0.6539930555555555 | 49.947 |
| 0.6540046296296297 | 49.95 |
| 0.6540162037037037 | 49.949 |
| 0.6540277777777778 | 49.949 |
| 0.6540393518518518 | 49.951 |
| 0.654050925925926 | 49.948 |
| 0.6540625 | 49.949 |
| 0.6540740740740741 | 49.949 |
| 0.6540856481481482 | 49.949 |
| 0.6540972222222222 | 49.951 |
| 0.6541087962962963 | 49.954 |
| 0.6541203703703703 | 49.958 |
| 0.6541319444444444 | 49.96 |
| 0.6541435185185185 | 49.964 |
| 0.6541550925925926 | 49.966 |
| 0.6541666666666667 | 49.968 |
| 0.6541782407407407 | 49.971 |
| 0.6541898148148148 | 49.973 |
| 0.6542013888888889 | 49.975 |
| 0.6542129629629629 | 49.976 |
| 0.6542245370370371 | 49.976 |
| 0.6542361111111111 | 49.974 |
| 0.6542476851851852 | 49.975 |
| 0.6542592592592592 | 49.973 |
| 0.6542708333333334 | 49.975 |
| 0.6542824074074074 | 49.976 |
| 0.6542939814814815 | 49.978 |
| 0.6543055555555556 | 49.979 |
| 0.6543171296296296 | 49.981 |
| 0.6543287037037037 | 49.98 |
| 0.6543402777777778 | 49.983 |
| 0.6543518518518519 | 49.98 |
| 0.6543634259259259 | 49.981 |
| 0.654375 | 49.981 |
| 0.6543865740740741 | 49.98 |
| 0.6543981481481481 | 49.98 |
| 0.6544097222222222 | 49.978 |
| 0.6544212962962963 | 49.976 |
| 0.6544328703703703 | 49.974 |
| 0.6544444444444445 | 49.974 |
| 0.6544560185185185 | 49.976 |
| 0.6544675925925926 | 49.976 |
| 0.6544791666666666 | 49.977 |
| 0.6544907407407408 | 49.977 |
| 0.6545023148148148 | 49.977 |
| 0.654513888888889 | 49.977 |
| 0.654525462962963 | 49.975 |
| 0.654537037037037 | 49.976 |
| 0.6545486111111111 | 49.973 |
| 0.6545601851851852 | 49.975 |
| 0.6545717592592593 | 49.969 |
| 0.6545833333333334 | 49.969 |
| 0.6545949074074074 | 49.967 |
| 0.6546064814814815 | 49.968 |
| 0.6546180555555555 | 49.971 |
| 0.6546296296296296 | 49.974 |
| 0.6546412037037037 | 49.978 |
| 0.6546527777777778 | 49.978 |
| 0.6546643518518519 | 49.983 |
| 0.6546759259259259 | 49.985 |
| 0.6546875 | 49.988 |
| 0.654699074074074 | 49.987 |
| 0.6547106481481482 | 49.987 |
| 0.6547222222222222 | 49.984 |
| 0.6547337962962964 | 49.984 |
| 0.6547453703703704 | 49.982 |
| 0.6547569444444444 | 49.98 |
| 0.6547685185185185 | 49.979 |
| 0.6547800925925926 | 49.98 |
| 0.6547916666666667 | 49.977 |
| 0.6548032407407408 | 49.976 |
| 0.6548148148148148 | 49.978 |
| 0.6548263888888889 | 49.977 |
| 0.6548379629629629 | 49.976 |
| 0.654849537037037 | 49.974 |
| 0.6548611111111111 | 49.974 |
| 0.6548726851851852 | 49.973 |
| 0.6548842592592593 | 49.975 |
| 0.6548958333333333 | 49.974 |
| 0.6549074074074074 | 49.978 |
| 0.6549189814814814 | 49.979 |
| 0.6549305555555556 | 49.981 |
| 0.6549421296296296 | 49.979 |
| 0.6549537037037038 | 49.982 |
| 0.6549652777777778 | 49.982 |
| 0.6549768518518518 | 49.982 |
| 0.6549884259259259 | 49.983 |
| 0.655 | 49.98 |
| 0.6550115740740741 | 49.981 |
| 0.6550231481481482 | 49.977 |
| 0.6550347222222223 | 49.977 |
| 0.6550462962962963 | 49.977 |
| 0.6550578703703703 | 49.976 |
| 0.6550694444444444 | 49.979 |
| 0.6550810185185185 | 49.978 |
| 0.6550925925925926 | 49.979 |
| 0.6551041666666667 | 49.98 |
| 0.6551157407407407 | 49.979 |
| 0.6551273148148148 | 49.981 |
| 0.6551388888888888 | 49.981 |
| 0.655150462962963 | 49.984 |
| 0.655162037037037 | 49.984 |
| 0.6551736111111112 | 49.984 |
| 0.6551851851851852 | 49.984 |
| 0.6551967592592592 | 49.984 |
| 0.6552083333333333 | 49.983 |
| 0.6552199074074074 | 49.983 |
| 0.6552314814814815 | 49.984 |
| 0.6552430555555556 | 49.982 |
| 0.6552546296296297 | 49.983 |
| 0.6552662037037037 | 49.981 |
| 0.6552777777777777 | 49.98 |
| 0.6552893518518519 | 49.975 |
| 0.6553009259259259 | 49.973 |
| 0.6553125 | 49.967 |
| 0.6553240740740741 | 49.967 |
| 0.6553356481481482 | 49.965 |
| 0.6553472222222222 | 49.964 |
| 0.6553587962962962 | 49.963 |
| 0.6553703703703704 | 49.964 |
| 0.6553819444444444 | 49.962 |
| 0.6553935185185186 | 49.962 |
| 0.6554050925925926 | 49.964 |
| 0.6554166666666666 | 49.968 |
| 0.6554282407407407 | 49.967 |
| 0.6554398148148148 | 49.969 |
| 0.6554513888888889 | 49.968 |
| 0.655462962962963 | 49.965 |
| 0.6554745370370371 | 49.965 |
| 0.6554861111111111 | 49.963 |
| 0.6554976851851851 | 49.961 |
| 0.6555092592592593 | 49.962 |
| 0.6555208333333333 | 49.96 |
| 0.6555324074074075 | 49.961 |
| 0.6555439814814815 | 49.957 |
| 0.6555555555555556 | 49.958 |
| 0.6555671296296296 | 49.958 |
| 0.6555787037037036 | 49.958 |
| 0.6555902777777778 | 49.961 |
| 0.6556018518518518 | 49.96 |
| 0.655613425925926 | 49.963 |
| 0.655625 | 49.962 |
| 0.655636574074074 | 49.962 |
| 0.6556481481481481 | 49.963 |
| 0.6556597222222222 | 49.961 |
| 0.6556712962962963 | 49.962 |
| 0.6556828703703704 | 49.963 |
| 0.6556944444444445 | 49.964 |
| 0.6557060185185185 | 49.965 |
| 0.6557175925925925 | 49.965 |
| 0.6557291666666667 | 49.966 |
| 0.6557407407407407 | 49.967 |
| 0.6557523148148149 | 49.967 |
| 0.6557638888888889 | 49.969 |
| 0.655775462962963 | 49.97 |
| 0.655787037037037 | 49.97 |
| 0.655798611111111 | 49.971 |
| 0.6558101851851852 | 49.97 |
| 0.6558217592592592 | 49.97 |
| 0.6558333333333334 | 49.969 |
| 0.6558449074074074 | 49.967 |
| 0.6558564814814815 | 49.966 |
| 0.6558680555555555 | 49.964 |
| 0.6558796296296296 | 49.964 |
| 0.6558912037037037 | 49.961 |
| 0.6559027777777778 | 49.962 |
| 0.6559143518518519 | 49.962 |
| 0.6559259259259259 | 49.964 |
| 0.6559375 | 49.967 |
| 0.6559490740740741 | 49.967 |
| 0.6559606481481481 | 49.969 |
| 0.6559722222222223 | 49.971 |
| 0.6559837962962963 | 49.97 |
| 0.6559953703703704 | 49.97 |
| 0.6560069444444444 | 49.97 |
| 0.6560185185185184 | 49.967 |
| 0.6560300925925926 | 49.968 |
| 0.6560416666666666 | 49.968 |
| 0.6560532407407408 | 49.966 |
| 0.6560648148148148 | 49.968 |
| 0.6560763888888889 | 49.968 |
| 0.6560879629629629 | 49.966 |
| 0.656099537037037 | 49.968 |
| 0.6561111111111111 | 49.968 |
| 0.6561226851851852 | 49.971 |
| 0.6561342592592593 | 49.97 |
| 0.6561458333333333 | 49.97 |
| 0.6561574074074074 | 49.971 |
| 0.6561689814814815 | 49.97 |
| 0.6561805555555555 | 49.972 |
| 0.6561921296296297 | 49.973 |
| 0.6562037037037037 | 49.976 |
| 0.6562152777777778 | 49.977 |
| 0.6562268518518518 | 49.978 |
| 0.656238425925926 | 49.977 |
| 0.65625 | 49.976 |
| 0.656261574074074 | 49.975 |
| 0.6562731481481482 | 49.973 |
| 0.6562847222222222 | 49.97 |
| 0.6562962962962963 | 49.97 |
| 0.6563078703703703 | 49.967 |
| 0.6563194444444445 | 49.97 |
| 0.6563310185185185 | 49.969 |
| 0.6563425925925926 | 49.971 |
| 0.6563541666666667 | 49.972 |
| 0.6563657407407407 | 49.975 |
| 0.6563773148148148 | 49.976 |
| 0.6563888888888889 | 49.978 |
| 0.656400462962963 | 49.976 |
| 0.6564120370370371 | 49.974 |
| 0.6564236111111111 | 49.974 |
| 0.6564351851851852 | 49.973 |
| 0.6564467592592592 | 49.97 |
| 0.6564583333333334 | 49.965 |
| 0.6564699074074074 | 49.962 |
| 0.6564814814814816 | 49.961 |
| 0.6564930555555556 | 49.959 |
| 0.6565046296296296 | 49.96 |
| 0.6565162037037037 | 49.956 |
| 0.6565277777777777 | 49.955 |
| 0.6565393518518519 | 49.953 |
| 0.6565509259259259 | 49.95 |
| 0.6565625 | 49.949 |
| 0.6565740740740741 | 49.948 |
| 0.6565856481481481 | 49.945 |
| 0.6565972222222222 | 49.947 |
| 0.6566087962962963 | 49.943 |
| 0.6566203703703704 | 49.945 |
| 0.6566319444444445 | 49.943 |
| 0.6566435185185185 | 49.943 |
| 0.6566550925925926 | 49.943 |
| 0.6566666666666666 | 49.942 |
| 0.6566782407407408 | 49.943 |
| 0.6566898148148148 | 49.94 |
| 0.656701388888889 | 49.943 |
| 0.656712962962963 | 49.941 |
| 0.656724537037037 | 49.943 |
| 0.6567361111111111 | 49.941 |
| 0.6567476851851851 | 49.943 |
| 0.6567592592592593 | 49.943 |
| 0.6567708333333333 | 49.944 |
| 0.6567824074074075 | 49.946 |
| 0.6567939814814815 | 49.948 |
| 0.6568055555555555 | 49.951 |
| 0.6568171296296296 | 49.951 |
| 0.6568287037037037 | 49.953 |
| 0.6568402777777778 | 49.953 |
| 0.6568518518518519 | 49.956 |
| 0.656863425925926 | 49.952 |
| 0.656875 | 49.955 |
| 0.656886574074074 | 49.954 |
| 0.6568981481481482 | 49.955 |
| 0.6569097222222222 | 49.956 |
| 0.6569212962962964 | 49.958 |
| 0.6569328703703704 | 49.956 |
| 0.6569444444444444 | 49.957 |
| 0.6569560185185185 | 49.955 |
| 0.6569675925925925 | 49.953 |
| 0.6569791666666667 | 49.953 |
| 0.6569907407407407 | 49.951 |
| 0.6570023148148149 | 49.949 |
| 0.6570138888888889 | 49.948 |
| 0.6570254629629629 | 49.945 |
| 0.657037037037037 | 49.944 |
| 0.6570486111111111 | 49.944 |
| 0.6570601851851852 | 49.942 |
| 0.6570717592592593 | 49.942 |
| 0.6570833333333334 | 49.944 |
| 0.6570949074074074 | 49.943 |
| 0.6571064814814814 | 49.942 |
| 0.6571180555555556 | 49.942 |
| 0.6571296296296296 | 49.94 |
| 0.6571412037037038 | 49.94 |
| 0.6571527777777778 | 49.938 |
| 0.6571643518518518 | 49.938 |
| 0.6571759259259259 | 49.937 |
| 0.6571875 | 49.935 |
| 0.6571990740740741 | 49.936 |
| 0.6572106481481481 | 49.936 |
| 0.6572222222222223 | 49.935 |
| 0.6572337962962963 | 49.935 |
| 0.6572453703703703 | 49.937 |
| 0.6572569444444444 | 49.936 |
| 0.6572685185185185 | 49.937 |
| 0.6572800925925926 | 49.936 |
| 0.6572916666666667 | 49.938 |
| 0.6573032407407408 | 49.938 |
| 0.6573148148148148 | 49.938 |
| 0.6573263888888888 | 49.941 |
| 0.657337962962963 | 49.942 |
| 0.657349537037037 | 49.943 |
| 0.6573611111111112 | 49.943 |
| 0.6573726851851852 | 49.943 |
| 0.6573842592592593 | 49.944 |
| 0.6573958333333333 | 49.946 |
| 0.6574074074074074 | 49.945 |
| 0.6574189814814815 | 49.947 |
| 0.6574305555555556 | 49.946 |
| 0.6574421296296297 | 49.946 |
| 0.6574537037037037 | 49.945 |
| 0.6574652777777777 | 49.944 |
| 0.6574768518518518 | 49.942 |
| 0.6574884259259259 | 49.942 |
| 0.6575 | 49.941 |
| 0.6575115740740741 | 49.941 |
| 0.6575231481481482 | 49.943 |
| 0.6575347222222222 | 49.941 |
| 0.6575462962962962 | 49.942 |
| 0.6575578703703704 | 49.941 |
| 0.6575694444444444 | 49.938 |
| 0.6575810185185186 | 49.939 |
| 0.6575925925925926 | 49.934 |
| 0.6576041666666667 | 49.933 |
| 0.6576157407407407 | 49.934 |
| 0.6576273148148148 | 49.934 |
| 0.6576388888888889 | 49.936 |
| 0.657650462962963 | 49.939 |
| 0.6576620370370371 | 49.94 |
| 0.6576736111111111 | 49.94 |
| 0.6576851851851852 | 49.944 |
| 0.6576967592592592 | 49.945 |
| 0.6577083333333333 | 49.949 |
| 0.6577199074074074 | 49.95 |
| 0.6577314814814815 | 49.951 |
| 0.6577430555555556 | 49.951 |
| 0.6577546296296296 | 49.95 |
| 0.6577662037037036 | 49.949 |
| 0.6577777777777778 | 49.947 |
| 0.6577893518518518 | 49.946 |
| 0.657800925925926 | 49.948 |
| 0.6578125 | 49.948 |
| 0.6578240740740741 | 49.949 |
| 0.6578356481481481 | 49.95 |
| 0.6578472222222222 | 49.953 |
| 0.6578587962962963 | 49.955 |
| 0.6578703703703704 | 49.956 |
| 0.6578819444444445 | 49.957 |
| 0.6578935185185185 | 49.958 |
| 0.6579050925925926 | 49.956 |
| 0.6579166666666666 | 49.955 |
| 0.6579282407407407 | 49.952 |
| 0.6579398148148148 | 49.948 |
| 0.6579513888888889 | 49.947 |
| 0.657962962962963 | 49.948 |
| 0.657974537037037 | 49.946 |
| 0.657986111111111 | 49.95 |
| 0.6579976851851852 | 49.952 |
| 0.6580092592592592 | 49.954 |
| 0.6580208333333334 | 49.958 |
| 0.6580324074074074 | 49.959 |
| 0.6580439814814815 | 49.962 |
| 0.6580555555555555 | 49.965 |
| 0.6580671296296297 | 49.966 |
| 0.6580787037037037 | 49.971 |
| 0.6580902777777778 | 49.974 |
| 0.6581018518518519 | 49.975 |
| 0.6581134259259259 | 49.975 |
| 0.658125 | 49.975 |
| 0.6581365740740741 | 49.971 |
| 0.6581481481481481 | 49.97 |
| 0.6581597222222222 | 49.968 |
| 0.6581712962962963 | 49.967 |
| 0.6581828703703704 | 49.962 |
| 0.6581944444444444 | 49.961 |
| 0.6582060185185185 | 49.959 |
| 0.6582175925925926 | 49.957 |
| 0.6582291666666666 | 49.956 |
| 0.6582407407407408 | 49.953 |
| 0.6582523148148148 | 49.952 |
| 0.6582638888888889 | 49.952 |
| 0.6582754629629629 | 49.948 |
| 0.6582870370370371 | 49.947 |
| 0.6582986111111111 | 49.944 |
| 0.6583101851851852 | 49.943 |
| 0.6583217592592593 | 49.94 |
| 0.6583333333333333 | 49.937 |
| 0.6583449074074074 | 49.934 |
| 0.6583564814814815 | 49.932 |
| 0.6583680555555556 | 49.93 |
| 0.6583796296296297 | 49.928 |
| 0.6583912037037037 | 49.928 |
| 0.6584027777777778 | 49.927 |
| 0.6584143518518518 | 49.927 |
| 0.6584259259259259 | 49.929 |
| 0.6584375 | 49.929 |
| 0.658449074074074 | 49.932 |
| 0.6584606481481482 | 49.931 |
| 0.6584722222222222 | 49.933 |
| 0.6584837962962963 | 49.934 |
| 0.6584953703703703 | 49.934 |
| 0.6585069444444445 | 49.934 |
| 0.6585185185185185 | 49.935 |
| 0.6585300925925927 | 49.933 |
| 0.6585416666666667 | 49.931 |
| 0.6585532407407407 | 49.93 |
| 0.6585648148148148 | 49.928 |
| 0.6585763888888889 | 49.927 |
| 0.658587962962963 | 49.923 |
| 0.6585995370370371 | 49.921 |
| 0.6586111111111111 | 49.919 |
| 0.6586226851851852 | 49.919 |
| 0.6586342592592592 | 49.918 |
| 0.6586458333333333 | 49.916 |
| 0.6586574074074074 | 49.917 |
| 0.6586689814814815 | 49.919 |
| 0.6586805555555556 | 49.92 |
| 0.6586921296296296 | 49.922 |
| 0.6587037037037037 | 49.921 |
| 0.6587152777777777 | 49.924 |
| 0.6587268518518519 | 49.922 |
| 0.6587384259259259 | 49.92 |
| 0.6587500000000001 | 49.919 |
| 0.6587615740740741 | 49.916 |
| 0.6587731481481481 | 49.914 |
| 0.6587847222222222 | 49.911 |
| 0.6587962962962963 | 49.909 |
| 0.6588078703703704 | 49.907 |
| 0.6588194444444445 | 49.904 |
| 0.6588310185185186 | 49.904 |
| 0.6588425925925926 | 49.903 |
| 0.6588541666666666 | 49.903 |
| 0.6588657407407407 | 49.904 |
| 0.6588773148148148 | 49.902 |
| 0.6588888888888889 | 49.904 |
| 0.658900462962963 | 49.905 |
| 0.658912037037037 | 49.904 |
| 0.6589236111111111 | 49.906 |
| 0.6589351851851851 | 49.905 |
| 0.6589467592592593 | 49.904 |
| 0.6589583333333333 | 49.905 |
| 0.6589699074074075 | 49.905 |
| 0.6589814814814815 | 49.905 |
| 0.6589930555555555 | 49.908 |
| 0.6590046296296296 | 49.908 |
| 0.6590162037037037 | 49.908 |
| 0.6590277777777778 | 49.91 |
| 0.6590393518518519 | 49.909 |
| 0.659050925925926 | 49.91 |
| 0.6590625 | 49.911 |
| 0.659074074074074 | 49.909 |
| 0.6590856481481482 | 49.909 |
| 0.6590972222222222 | 49.908 |
| 0.6591087962962963 | 49.906 |
| 0.6591203703703704 | 49.906 |
| 0.6591319444444445 | 49.911 |
| 0.6591435185185185 | 49.913 |
| 0.6591550925925925 | 49.916 |
| 0.6591666666666667 | 49.918 |
| 0.6591782407407407 | 49.921 |
| 0.6591898148148149 | 49.922 |
| 0.6592013888888889 | 49.925 |
| 0.659212962962963 | 49.927 |
| 0.659224537037037 | 49.925 |
| 0.6592361111111111 | 49.923 |
| 0.6592476851851852 | 49.92 |
| 0.6592592592592593 | 49.917 |
| 0.6592708333333334 | 49.914 |
| 0.6592824074074074 | 49.91 |
| 0.6592939814814814 | 49.909 |
| 0.6593055555555556 | 49.908 |
| 0.6593171296296296 | 49.907 |
| 0.6593287037037037 | 49.91 |
| 0.6593402777777778 | 49.91 |
| 0.6593518518518519 | 49.91 |
| 0.6593634259259259 | 49.911 |
| 0.6593749999999999 | 49.912 |
| 0.6593865740740741 | 49.912 |
| 0.6593981481481481 | 49.911 |
| 0.6594097222222223 | 49.91 |
| 0.6594212962962963 | 49.91 |
| 0.6594328703703703 | 49.906 |
| 0.6594444444444444 | 49.904 |
| 0.6594560185185185 | 49.903 |
| 0.6594675925925926 | 49.904 |
| 0.6594791666666667 | 49.904 |
| 0.6594907407407408 | 49.903 |
| 0.6595023148148148 | 49.906 |
| 0.6595138888888888 | 49.906 |
| 0.659525462962963 | 49.907 |
| 0.659537037037037 | 49.908 |
| 0.6595486111111112 | 49.909 |
| 0.6595601851851852 | 49.909 |
| 0.6595717592592593 | 49.91 |
| 0.6595833333333333 | 49.911 |
| 0.6595949074074073 | 49.911 |
| 0.6596064814814815 | 49.909 |
| 0.6596180555555555 | 49.908 |
| 0.6596296296296297 | 49.904 |
| 0.6596412037037037 | 49.903 |
| 0.6596527777777778 | 49.9 |
| 0.6596643518518518 | 49.898 |
| 0.6596759259259259 | 49.897 |
| 0.6596875 | 49.898 |
| 0.6596990740740741 | 49.9 |
| 0.6597106481481482 | 49.902 |
| 0.6597222222222222 | 49.904 |
| 0.6597337962962962 | 49.905 |
| 0.6597453703703704 | 49.907 |
| 0.6597569444444444 | 49.906 |
| 0.6597685185185186 | 49.906 |
| 0.6597800925925926 | 49.908 |
| 0.6597916666666667 | 49.908 |
| 0.6598032407407407 | 49.907 |
| 0.6598148148148147 | 49.908 |
| 0.6598263888888889 | 49.908 |
| 0.6598379629629629 | 49.91 |
| 0.6598495370370371 | 49.91 |
| 0.6598611111111111 | 49.91 |
| 0.6598726851851852 | 49.909 |
| 0.6598842592592592 | 49.909 |
| 0.6598958333333333 | 49.909 |
| 0.6599074074074074 | 49.91 |
| 0.6599189814814815 | 49.91 |
| 0.6599305555555556 | 49.911 |
| 0.6599421296296296 | 49.909 |
| 0.6599537037037037 | 49.909 |
| 0.6599652777777778 | 49.91 |
| 0.6599768518518518 | 49.909 |
| 0.659988425925926 | 49.907 |
| 0.66 | 49.907 |
| 0.6600115740740741 | 49.904 |
| 0.6600231481481481 | 49.902 |
| 0.6600347222222223 | 49.901 |
| 0.6600462962962963 | 49.901 |
| 0.6600578703703703 | 49.9 |
| 0.6600694444444445 | 49.901 |
| 0.6600810185185185 | 49.902 |
| 0.6600925925925926 | 49.901 |
| 0.6601041666666666 | 49.901 |
| 0.6601157407407408 | 49.901 |
| 0.6601273148148148 | 49.901 |
| 0.6601388888888889 | 49.9 |
| 0.660150462962963 | 49.9 |
| 0.660162037037037 | 49.901 |
| 0.6601736111111111 | 49.901 |
| 0.6601851851851852 | 49.9 |
| 0.6601967592592592 | 49.899 |
| 0.6602083333333334 | 49.899 |
| 0.6602199074074074 | 49.899 |
| 0.6602314814814815 | 49.898 |
| 0.6602430555555555 | 49.901 |
| 0.6602546296296297 | 49.903 |
| 0.6602662037037037 | 49.904 |
| 0.6602777777777777 | 49.906 |
| 0.6602893518518519 | 49.906 |
| 0.6603009259259259 | 49.908 |
| 0.6603125 | 49.909 |
| 0.660324074074074 | 49.911 |
| 0.6603356481481482 | 49.911 |
| 0.6603472222222222 | 49.913 |
| 0.6603587962962963 | 49.915 |
| 0.6603703703703704 | 49.916 |
| 0.6603819444444444 | 49.917 |
| 0.6603935185185185 | 49.917 |
| 0.6604050925925926 | 49.918 |
| 0.6604166666666667 | 49.918 |
| 0.6604282407407408 | 49.917 |
| 0.6604398148148148 | 49.916 |
| 0.6604513888888889 | 49.917 |
| 0.6604629629629629 | 49.918 |
| 0.6604745370370371 | 49.918 |
| 0.6604861111111111 | 49.92 |
| 0.6604976851851853 | 49.919 |
| 0.6605092592592593 | 49.918 |
| 0.6605208333333333 | 49.919 |
| 0.6605324074074074 | 49.916 |
| 0.6605439814814814 | 49.913 |
| 0.6605555555555556 | 49.911 |
| 0.6605671296296296 | 49.91 |
| 0.6605787037037038 | 49.91 |
| 0.6605902777777778 | 49.912 |
| 0.6606018518518518 | 49.912 |
| 0.6606134259259259 | 49.913 |
| 0.660625 | 49.912 |
| 0.6606365740740741 | 49.912 |
| 0.6606481481481482 | 49.912 |
| 0.6606597222222222 | 49.911 |
| 0.6606712962962963 | 49.911 |
| 0.6606828703703703 | 49.911 |
| 0.6606944444444445 | 49.91 |
| 0.6607060185185185 | 49.907 |
| 0.6607175925925927 | 49.905 |
| 0.6607291666666667 | 49.903 |
| 0.6607407407407407 | 49.901 |
| 0.6607523148148148 | 49.901 |
| 0.6607638888888888 | 49.901 |
| 0.660775462962963 | 49.904 |
| 0.660787037037037 | 49.904 |
| 0.6607986111111112 | 49.903 |
| 0.6608101851851852 | 49.904 |
| 0.6608217592592592 | 49.903 |
| 0.6608333333333333 | 49.902 |
| 0.6608449074074074 | 49.9 |
| 0.6608564814814815 | 49.898 |
| 0.6608680555555556 | 49.897 |
| 0.6608796296296297 | 49.895 |
| 0.6608912037037037 | 49.894 |
| 0.6609027777777777 | 49.893 |
| 0.6609143518518519 | 49.892 |
| 0.6609259259259259 | 49.889 |
| 0.6609375000000001 | 49.887 |
| 0.6609490740740741 | 49.885 |
| 0.6609606481481481 | 49.885 |
| 0.6609722222222222 | 49.884 |
| 0.6609837962962963 | 49.883 |
| 0.6609953703703704 | 49.882 |
| 0.6610069444444444 | 49.881 |
| 0.6610185185185186 | 49.88 |
| 0.6610300925925926 | 49.879 |
| 0.6610416666666666 | 49.878 |
| 0.6610532407407407 | 49.877 |
| 0.6610648148148148 | 49.876 |
| 0.6610763888888889 | 49.876 |
| 0.661087962962963 | 49.876 |
| 0.661099537037037 | 49.876 |
| 0.6611111111111111 | 49.877 |
| 0.6611226851851851 | 49.876 |
| 0.6611342592592593 | 49.878 |
| 0.6611458333333333 | 49.881 |
| 0.6611574074074075 | 49.883 |
| 0.6611689814814815 | 49.886 |
| 0.6611805555555555 | 49.889 |
| 0.6611921296296296 | 49.89 |
| 0.6612037037037037 | 49.892 |
| 0.6612152777777778 | 49.893 |
| 0.6612268518518518 | 49.897 |
| 0.661238425925926 | 49.899 |
| 0.66125 | 49.899 |
| 0.661261574074074 | 49.901 |
| 0.6612731481481481 | 49.903 |
| 0.6612847222222222 | 49.904 |
| 0.6612962962962963 | 49.906 |
| 0.6613078703703704 | 49.909 |
| 0.6613194444444445 | 49.908 |
| 0.6613310185185185 | 49.907 |
| 0.6613425925925925 | 49.911 |
| 0.6613541666666667 | 49.913 |
| 0.6613657407407407 | 49.915 |
| 0.6613773148148149 | 49.916 |
| 0.6613888888888889 | 49.918 |
| 0.661400462962963 | 49.92 |
| 0.661412037037037 | 49.92 |
| 0.6614236111111111 | 49.919 |
| 0.6614351851851852 | 49.92 |
| 0.6614467592592593 | 49.918 |
| 0.6614583333333334 | 49.915 |
| 0.6614699074074074 | 49.913 |
| 0.6614814814814814 | 49.91 |
| 0.6614930555555555 | 49.91 |
| 0.6615046296296296 | 49.908 |
| 0.6615162037037037 | 49.907 |
| 0.6615277777777778 | 49.906 |
| 0.6615393518518519 | 49.905 |
| 0.6615509259259259 | 49.904 |
| 0.6615624999999999 | 49.902 |
| 0.6615740740740741 | 49.901 |
| 0.6615856481481481 | 49.899 |
| 0.6615972222222223 | 49.897 |
| 0.6616087962962963 | 49.895 |
| 0.6616203703703704 | 49.893 |
| 0.6616319444444444 | 49.891 |
| 0.6616435185185185 | 49.89 |
| 0.6616550925925926 | 49.889 |
| 0.6616666666666667 | 49.888 |
| 0.6616782407407408 | 49.889 |
| 0.6616898148148148 | 49.89 |
| 0.6617013888888889 | 49.893 |
| 0.6617129629629629 | 49.893 |
| 0.661724537037037 | 49.894 |
| 0.6617361111111111 | 49.897 |
| 0.6617476851851852 | 49.896 |
| 0.6617592592592593 | 49.897 |
| 0.6617708333333333 | 49.896 |
| 0.6617824074074073 | 49.895 |
| 0.6617939814814815 | 49.896 |
| 0.6618055555555555 | 49.892 |
| 0.6618171296296297 | 49.889 |
| 0.6618287037037037 | 49.888 |
| 0.6618402777777778 | 49.884 |
| 0.6618518518518518 | 49.878 |
| 0.661863425925926 | 49.876 |
| 0.661875 | 49.873 |
| 0.6618865740740741 | 49.872 |
| 0.6618981481481482 | 49.871 |
| 0.6619097222222222 | 49.871 |
| 0.6619212962962963 | 49.871 |
| 0.6619328703703703 | 49.87 |
| 0.6619444444444444 | 49.87 |
| 0.6619560185185185 | 49.871 |
| 0.6619675925925926 | 49.871 |
| 0.6619791666666667 | 49.869 |
| 0.6619907407407407 | 49.868 |
| 0.6620023148148148 | 49.867 |
| 0.6620138888888889 | 49.868 |
| 0.6620254629629629 | 49.869 |
| 0.6620370370370371 | 49.87 |
| 0.6620486111111111 | 49.871 |
| 0.6620601851851852 | 49.874 |
| 0.6620717592592592 | 49.876 |
| 0.6620833333333334 | 49.877 |
| 0.6620949074074074 | 49.879 |
| 0.6621064814814815 | 49.877 |
| 0.6621180555555556 | 49.875 |
| 0.6621296296296296 | 49.873 |
| 0.6621412037037037 | 49.87 |
| 0.6621527777777778 | 49.866 |
| 0.6621643518518519 | 49.866 |
| 0.6621759259259259 | 49.867 |
| 0.6621875 | 49.87 |
| 0.6621990740740741 | 49.873 |
| 0.6622106481481481 | 49.875 |
| 0.6622222222222222 | 49.878 |
| 0.6622337962962963 | 49.881 |
| 0.6622453703703703 | 49.882 |
| 0.6622569444444445 | 49.883 |
| 0.6622685185185185 | 49.882 |
| 0.6622800925925926 | 49.879 |
| 0.6622916666666666 | 49.875 |
| 0.6623032407407408 | 49.868 |
| 0.6623148148148148 | 49.864 |
| 0.662326388888889 | 49.858 |
| 0.662337962962963 | 49.856 |
| 0.662349537037037 | 49.855 |
| 0.6623611111111111 | 49.853 |
| 0.6623726851851852 | 49.855 |
| 0.6623842592592593 | 49.856 |
| 0.6623958333333334 | 49.855 |
| 0.6624074074074074 | 49.857 |
| 0.6624189814814815 | 49.858 |
| 0.6624305555555555 | 49.86 |
| 0.6624421296296296 | 49.863 |
| 0.6624537037037037 | 49.864 |
| 0.6624652777777778 | 49.867 |
| 0.6624768518518519 | 49.869 |
| 0.6624884259259259 | 49.87 |
| 0.6625 | 49.87 |
| 0.662511574074074 | 49.87 |
| 0.6625231481481482 | 49.869 |
| 0.6625347222222222 | 49.868 |
| 0.6625462962962964 | 49.867 |
| 0.6625578703703704 | 49.864 |
| 0.6625694444444444 | 49.863 |
| 0.6625810185185185 | 49.861 |
| 0.6625925925925926 | 49.858 |
| 0.6626041666666667 | 49.857 |
| 0.6626157407407408 | 49.857 |
| 0.6626273148148148 | 49.856 |
| 0.6626388888888889 | 49.856 |
| 0.6626504629629629 | 49.858 |
| 0.662662037037037 | 49.859 |
| 0.6626736111111111 | 49.861 |
| 0.6626851851851852 | 49.862 |
| 0.6626967592592593 | 49.863 |
| 0.6627083333333333 | 49.865 |
| 0.6627199074074074 | 49.868 |
| 0.6627314814814814 | 49.87 |
| 0.6627430555555556 | 49.87 |
| 0.6627546296296296 | 49.87 |
| 0.6627662037037038 | 49.869 |
| 0.6627777777777778 | 49.868 |
| 0.6627893518518518 | 49.867 |
| 0.6628009259259259 | 49.864 |
| 0.6628125 | 49.862 |
| 0.6628240740740741 | 49.861 |
| 0.6628356481481482 | 49.86 |
| 0.6628472222222223 | 49.857 |
| 0.6628587962962963 | 49.856 |
| 0.6628703703703703 | 49.856 |
| 0.6628819444444444 | 49.855 |
| 0.6628935185185185 | 49.854 |
| 0.6629050925925926 | 49.855 |
| 0.6629166666666667 | 49.853 |
| 0.6629282407407407 | 49.857 |
| 0.6629398148148148 | 49.858 |
| 0.6629513888888888 | 49.858 |
| 0.662962962962963 | 49.859 |
| 0.662974537037037 | 49.859 |
| 0.6629861111111112 | 49.858 |
| 0.6629976851851852 | 49.857 |
| 0.6630092592592592 | 49.855 |
| 0.6630208333333333 | 49.855 |
| 0.6630324074074074 | 49.856 |
| 0.6630439814814815 | 49.853 |
| 0.6630555555555556 | 49.853 |
| 0.6630671296296297 | 49.851 |
| 0.6630787037037037 | 49.851 |
| 0.6630902777777777 | 49.852 |
| 0.6631018518518519 | 49.85 |
| 0.6631134259259259 | 49.846 |
| 0.663125 | 49.844 |
| 0.6631365740740741 | 49.842 |
| 0.6631481481481482 | 49.839 |
| 0.6631597222222222 | 49.838 |
| 0.6631712962962962 | 49.837 |
| 0.6631828703703704 | 49.835 |
| 0.6631944444444444 | 49.832 |
| 0.6632060185185186 | 49.831 |
| 0.6632175925925926 | 49.829 |
| 0.6632291666666666 | 49.827 |
| 0.6632407407407407 | 49.826 |
| 0.6632523148148148 | 49.825 |
| 0.6632638888888889 | 49.826 |
| 0.663275462962963 | 49.827 |
| 0.6632870370370371 | 49.828 |
| 0.6632986111111111 | 49.83 |
| 0.6633101851851851 | 49.831 |
| 0.6633217592592593 | 49.833 |
| 0.6633333333333333 | 49.836 |
| 0.6633449074074075 | 49.84 |
| 0.6633564814814815 | 49.839 |
| 0.6633680555555556 | 49.841 |
| 0.6633796296296296 | 49.843 |
| 0.6633912037037036 | 49.845 |
| 0.6634027777777778 | 49.848 |
| 0.6634143518518518 | 49.853 |
| 0.663425925925926 | 49.86 |
| 0.6634375 | 49.867 |
| 0.663449074074074 | 49.873 |
| 0.6634606481481481 | 49.878 |
| 0.6634722222222222 | 49.881 |
| 0.6634837962962963 | 49.883 |
| 0.6634953703703704 | 49.888 |
| 0.6635069444444445 | 49.89 |
| 0.6635185185185185 | 49.892 |
| 0.6635300925925925 | 49.896 |
| 0.6635416666666667 | 49.896 |
| 0.6635532407407407 | 49.896 |
| 0.6635648148148149 | 49.898 |
| 0.6635763888888889 | 49.901 |
| 0.663587962962963 | 49.903 |
| 0.663599537037037 | 49.906 |
| 0.663611111111111 | 49.91 |
| 0.6636226851851852 | 49.912 |
| 0.6636342592592592 | 49.916 |
| 0.6636458333333334 | 49.919 |
| 0.6636574074074074 | 49.922 |
| 0.6636689814814815 | 49.924 |
| 0.6636805555555555 | 49.927 |
| 0.6636921296296296 | 49.93 |
| 0.6637037037037037 | 49.932 |
| 0.6637152777777778 | 49.933 |
| 0.6637268518518519 | 49.933 |
| 0.6637384259259259 | 49.937 |
| 0.66375 | 49.941 |
| 0.6637615740740741 | 49.944 |
| 0.6637731481481481 | 49.945 |
| 0.6637847222222223 | 49.946 |
| 0.6637962962962963 | 49.946 |
| 0.6638078703703704 | 49.947 |
| 0.6638194444444444 | 49.946 |
| 0.6638310185185184 | 49.944 |
| 0.6638425925925926 | 49.944 |
| 0.6638541666666666 | 49.943 |
| 0.6638657407407408 | 49.942 |
| 0.6638773148148148 | 49.943 |
| 0.6638888888888889 | 49.941 |
| 0.6639004629629629 | 49.939 |
| 0.663912037037037 | 49.938 |
| 0.6639236111111111 | 49.937 |
| 0.6639351851851852 | 49.937 |
| 0.6639467592592593 | 49.936 |
| 0.6639583333333333 | 49.936 |
| 0.6639699074074074 | 49.934 |
| 0.6639814814814815 | 49.934 |
| 0.6639930555555555 | 49.936 |
| 0.6640046296296297 | 49.936 |
| 0.6640162037037037 | 49.936 |
| 0.6640277777777778 | 49.935 |
| 0.6640393518518518 | 49.936 |
| 0.664050925925926 | 49.936 |
| 0.6640625 | 49.936 |
| 0.664074074074074 | 49.936 |
| 0.6640856481481482 | 49.936 |
| 0.6640972222222222 | 49.935 |
| 0.6641087962962963 | 49.936 |
| 0.6641203703703703 | 49.938 |
| 0.6641319444444445 | 49.937 |
| 0.6641435185185185 | 49.936 |
| 0.6641550925925926 | 49.934 |
| 0.6641666666666667 | 49.935 |
| 0.6641782407407407 | 49.937 |
| 0.6641898148148148 | 49.937 |
| 0.6642013888888889 | 49.938 |
| 0.664212962962963 | 49.941 |
| 0.6642245370370371 | 49.943 |
| 0.6642361111111111 | 49.945 |
| 0.6642476851851852 | 49.948 |
| 0.6642592592592592 | 49.95 |
| 0.6642708333333334 | 49.951 |
| 0.6642824074074074 | 49.951 |
| 0.6642939814814816 | 49.954 |
| 0.6643055555555556 | 49.955 |
| 0.6643171296296296 | 49.956 |
| 0.6643287037037037 | 49.955 |
| 0.6643402777777777 | 49.955 |
| 0.6643518518518519 | 49.953 |
| 0.6643634259259259 | 49.949 |
| 0.664375 | 49.946 |
| 0.6643865740740741 | 49.944 |
| 0.6643981481481481 | 49.942 |
| 0.6644097222222222 | 49.942 |
| 0.6644212962962963 | 49.941 |
| 0.6644328703703704 | 49.94 |
| 0.6644444444444445 | 49.94 |
| 0.6644560185185185 | 49.94 |
| 0.6644675925925926 | 49.94 |
| 0.6644791666666666 | 49.939 |
| 0.6644907407407408 | 49.938 |
| 0.6645023148148148 | 49.939 |
| 0.664513888888889 | 49.939 |
| 0.664525462962963 | 49.94 |
| 0.664537037037037 | 49.942 |
| 0.6645486111111111 | 49.945 |
| 0.6645601851851851 | 49.948 |
| 0.6645717592592593 | 49.95 |
| 0.6645833333333333 | 49.949 |
| 0.6645949074074075 | 49.947 |
| 0.6646064814814815 | 49.948 |
| 0.6646180555555555 | 49.945 |
| 0.6646296296296296 | 49.943 |
| 0.6646412037037037 | 49.94 |
| 0.6646527777777778 | 49.938 |
| 0.6646643518518519 | 49.936 |
| 0.664675925925926 | 49.933 |
| 0.6646875 | 49.935 |
| 0.664699074074074 | 49.935 |
| 0.6647106481481482 | 49.935 |
| 0.6647222222222222 | 49.935 |
| 0.6647337962962964 | 49.933 |
| 0.6647453703703704 | 49.934 |
| 0.6647569444444444 | 49.933 |
| 0.6647685185185185 | 49.933 |
| 0.6647800925925925 | 49.933 |
| 0.6647916666666667 | 49.933 |
| 0.6648032407407407 | 49.931 |
| 0.6648148148148149 | 49.93 |
| 0.6648263888888889 | 49.93 |
| 0.6648379629629629 | 49.928 |
| 0.664849537037037 | 49.929 |
| 0.6648611111111111 | 49.929 |
| 0.6648726851851852 | 49.929 |
| 0.6648842592592593 | 49.929 |
| 0.6648958333333334 | 49.928 |
| 0.6649074074074074 | 49.928 |
| 0.6649189814814814 | 49.93 |
| 0.6649305555555556 | 49.932 |
| 0.6649421296296296 | 49.935 |
| 0.6649537037037038 | 49.94 |
| 0.6649652777777778 | 49.945 |
| 0.6649768518518518 | 49.949 |
| 0.6649884259259259 | 49.952 |
| 0.665 | 49.955 |
| 0.6650115740740741 | 49.957 |
| 0.6650231481481481 | 49.959 |
| 0.6650347222222223 | 49.96 |
| 0.6650462962962963 | 49.961 |
| 0.6650578703703703 | 49.961 |
| 0.6650694444444444 | 49.963 |
| 0.6650810185185185 | 49.963 |
| 0.6650925925925926 | 49.962 |
| 0.6651041666666667 | 49.96 |
| 0.6651157407407408 | 49.96 |
| 0.6651273148148148 | 49.958 |
| 0.6651388888888888 | 49.957 |
| 0.665150462962963 | 49.956 |
| 0.665162037037037 | 49.954 |
| 0.6651736111111112 | 49.955 |
| 0.6651851851851852 | 49.954 |
| 0.6651967592592593 | 49.955 |
| 0.6652083333333333 | 49.954 |
| 0.6652199074074074 | 49.952 |
| 0.6652314814814815 | 49.951 |
| 0.6652430555555556 | 49.951 |
| 0.6652546296296297 | 49.95 |
| 0.6652662037037037 | 49.947 |
| 0.6652777777777777 | 49.946 |
| 0.6652893518518518 | 49.947 |
| 0.6653009259259259 | 49.946 |
| 0.6653125 | 49.947 |
| 0.6653240740740741 | 49.948 |
| 0.6653356481481482 | 49.947 |
| 0.6653472222222222 | 49.946 |
| 0.6653587962962962 | 49.947 |
| 0.6653703703703704 | 49.949 |
| 0.6653819444444444 | 49.947 |
| 0.6653935185185186 | 49.948 |
| 0.6654050925925926 | 49.949 |
| 0.6654166666666667 | 49.949 |
| 0.6654282407407407 | 49.949 |
| 0.6654398148148148 | 49.949 |
| 0.6654513888888889 | 49.949 |
| 0.665462962962963 | 49.95 |
| 0.6654745370370371 | 49.949 |
| 0.6654861111111111 | 49.949 |
| 0.6654976851851852 | 49.95 |
| 0.6655092592592592 | 49.949 |
| 0.6655208333333333 | 49.95 |
| 0.6655324074074074 | 49.949 |
| 0.6655439814814815 | 49.949 |
| 0.6655555555555556 | 49.949 |
| 0.6655671296296296 | 49.95 |
| 0.6655787037037036 | 49.948 |
| 0.6655902777777778 | 49.945 |
| 0.6656018518518518 | 49.943 |
| 0.665613425925926 | 49.94 |
| 0.665625 | 49.937 |
| 0.6656365740740741 | 49.935 |
| 0.6656481481481481 | 49.932 |
| 0.6656597222222222 | 49.932 |
| 0.6656712962962963 | 49.932 |
| 0.6656828703703704 | 49.931 |
| 0.6656944444444445 | 49.931 |
| 0.6657060185185185 | 49.932 |
| 0.6657175925925926 | 49.933 |
| 0.6657291666666666 | 49.934 |
| 0.6657407407407407 | 49.935 |
| 0.6657523148148148 | 49.934 |
| 0.6657638888888889 | 49.937 |
| 0.665775462962963 | 49.937 |
| 0.665787037037037 | 49.938 |
| 0.665798611111111 | 49.937 |
| 0.6658101851851852 | 49.936 |
| 0.6658217592592592 | 49.937 |
| 0.6658333333333334 | 49.938 |
| 0.6658449074074074 | 49.939 |
| 0.6658564814814815 | 49.94 |
| 0.6658680555555555 | 49.937 |
| 0.6658796296296297 | 49.936 |
| 0.6658912037037037 | 49.937 |
| 0.6659027777777778 | 49.937 |
| 0.6659143518518519 | 49.937 |
| 0.6659259259259259 | 49.937 |
| 0.6659375 | 49.937 |
| 0.6659490740740741 | 49.938 |
| 0.6659606481481481 | 49.939 |
| 0.6659722222222222 | 49.937 |
| 0.6659837962962963 | 49.934 |
| 0.6659953703703704 | 49.933 |
| 0.6660069444444444 | 49.932 |
| 0.6660185185185185 | 49.933 |
| 0.6660300925925926 | 49.934 |
| 0.6660416666666666 | 49.938 |
| 0.6660532407407408 | 49.942 |
| 0.6660648148148148 | 49.946 |
| 0.6660763888888889 | 49.947 |
| 0.6660879629629629 | 49.947 |
| 0.6660995370370371 | 49.947 |
| 0.6661111111111111 | 49.949 |
| 0.6661226851851852 | 49.947 |
| 0.6661342592592593 | 49.946 |
| 0.6661458333333333 | 49.944 |
| 0.6661574074074074 | 49.943 |
| 0.6661689814814815 | 49.942 |
| 0.6661805555555556 | 49.941 |
| 0.6661921296296297 | 49.943 |
| 0.6662037037037037 | 49.944 |
| 0.6662152777777778 | 49.946 |
| 0.6662268518518518 | 49.948 |
| 0.6662384259259259 | 49.948 |
| 0.66625 | 49.945 |
| 0.666261574074074 | 49.945 |
| 0.6662731481481482 | 49.944 |
| 0.6662847222222222 | 49.941 |
| 0.6662962962962963 | 49.939 |
| 0.6663078703703703 | 49.936 |
| 0.6663194444444445 | 49.937 |
| 0.6663310185185185 | 49.936 |
| 0.6663425925925927 | 49.933 |
| 0.6663541666666667 | 49.932 |
| 0.6663657407407407 | 49.932 |
| 0.6663773148148148 | 49.934 |
| 0.6663888888888889 | 49.934 |
| 0.666400462962963 | 49.936 |
| 0.6664120370370371 | 49.937 |
| 0.6664236111111111 | 49.941 |
| 0.6664351851851852 | 49.943 |
| 0.6664467592592592 | 49.945 |
| 0.6664583333333333 | 49.948 |
| 0.6664699074074074 | 49.949 |
| 0.6664814814814815 | 49.953 |
| 0.6664930555555556 | 49.955 |
| 0.6665046296296296 | 49.955 |
| 0.6665162037037037 | 49.954 |
| 0.6665277777777777 | 49.954 |
| 0.6665393518518519 | 49.955 |
| 0.6665509259259259 | 49.956 |
| 0.6665625000000001 | 49.957 |
| 0.6665740740740741 | 49.958 |
| 0.6665856481481481 | 49.959 |
| 0.6665972222222222 | 49.957 |
| 0.6666087962962963 | 49.958 |
| 0.6666203703703704 | 49.955 |
| 0.6666319444444445 | 49.954 |
| 0.6666435185185186 | 49.953 |
| 0.6666550925925926 | 49.955 |
| 0.6666666666666666 | 49.953 |
| 0.6666782407407408 | 49.952 |
| 0.6666898148148147 | 49.95 |
| 0.6667013888888889 | 49.947 |
| 0.666712962962963 | 49.946 |
| 0.666724537037037 | 49.944 |
| 0.6667361111111111 | 49.946 |
| 0.6667476851851851 | 49.945 |
| 0.6667592592592593 | 49.944 |
| 0.6667708333333334 | 49.948 |
| 0.6667824074074074 | 49.95 |
| 0.6667939814814815 | 49.952 |
| 0.6668055555555555 | 49.953 |
| 0.6668171296296297 | 49.955 |
| 0.6668287037037036 | 49.956 |
| 0.6668402777777778 | 49.958 |
| 0.6668518518518519 | 49.958 |
| 0.666863425925926 | 49.96 |
| 0.666875 | 49.96 |
| 0.666886574074074 | 49.96 |
| 0.6668981481481482 | 49.959 |
| 0.6669097222222221 | 49.958 |
| 0.6669212962962963 | 49.959 |
| 0.6669328703703704 | 49.958 |
| 0.6669444444444445 | 49.957 |
| 0.6669560185185185 | 49.957 |
| 0.6669675925925925 | 49.955 |
| 0.6669791666666667 | 49.954 |
| 0.6669907407407408 | 49.952 |
| 0.6670023148148148 | 49.951 |
| 0.6670138888888889 | 49.949 |
| 0.667025462962963 | 49.947 |
| 0.6670370370370371 | 49.946 |
| 0.667048611111111 | 49.944 |
| 0.6670601851851852 | 49.944 |
| 0.6670717592592593 | 49.943 |
| 0.6670833333333334 | 49.941 |
| 0.6670949074074074 | 49.941 |
| 0.6671064814814814 | 49.942 |
| 0.6671180555555556 | 49.94 |
| 0.6671296296296297 | 49.941 |
| 0.6671412037037037 | 49.94 |
| 0.6671527777777778 | 49.938 |
| 0.6671643518518519 | 49.939 |
| 0.6671759259259259 | 49.937 |
| 0.6671874999999999 | 49.937 |
| 0.6671990740740741 | 49.938 |
| 0.6672106481481482 | 49.938 |
| 0.6672222222222222 | 49.94 |
| 0.6672337962962963 | 49.938 |
| 0.6672453703703703 | 49.939 |
| 0.6672569444444445 | 49.938 |
| 0.6672685185185184 | 49.936 |
| 0.6672800925925926 | 49.933 |
| 0.6672916666666667 | 49.934 |
| 0.6673032407407408 | 49.934 |
| 0.6673148148148148 | 49.933 |
| 0.6673263888888888 | 49.932 |
| 0.667337962962963 | 49.933 |
| 0.6673495370370371 | 49.933 |
| 0.6673611111111111 | 49.933 |
| 0.6673726851851852 | 49.932 |
| 0.6673842592592593 | 49.932 |
| 0.6673958333333333 | 49.932 |
| 0.6674074074074073 | 49.934 |
| 0.6674189814814815 | 49.93 |
| 0.6674305555555556 | 49.927 |
| 0.6674421296296296 | 49.925 |
| 0.6674537037037037 | 49.923 |
| 0.6674652777777778 | 49.921 |
| 0.6674768518518519 | 49.919 |
| 0.6674884259259258 | 49.919 |
| 0.6675 | 49.916 |
| 0.6675115740740741 | 49.917 |
| 0.6675231481481482 | 49.916 |
| 0.6675347222222222 | 49.916 |
| 0.6675462962962962 | 49.917 |
| 0.6675578703703704 | 49.916 |
| 0.6675694444444445 | 49.917 |
| 0.6675810185185185 | 49.916 |
| 0.6675925925925926 | 49.92 |
| 0.6676041666666667 | 49.923 |
| 0.6676157407407407 | 49.925 |
| 0.6676273148148147 | 49.928 |
| 0.6676388888888889 | 49.929 |
| 0.667650462962963 | 49.929 |
| 0.667662037037037 | 49.928 |
| 0.6676736111111111 | 49.928 |
| 0.6676851851851852 | 49.925 |
| 0.6676967592592593 | 49.922 |
| 0.6677083333333332 | 49.919 |
| 0.6677199074074074 | 49.917 |
| 0.6677314814814815 | 49.915 |
| 0.6677430555555556 | 49.914 |
| 0.6677546296296296 | 49.914 |
| 0.6677662037037037 | 49.916 |
| 0.6677777777777778 | 49.918 |
| 0.667789351851852 | 49.92 |
| 0.6678009259259259 | 49.922 |
| 0.6678125 | 49.924 |
| 0.6678240740740741 | 49.926 |
| 0.6678356481481482 | 49.924 |
| 0.6678472222222221 | 49.923 |
| 0.6678587962962963 | 49.921 |
| 0.6678703703703704 | 49.919 |
| 0.6678819444444444 | 49.918 |
| 0.6678935185185185 | 49.918 |
| 0.6679050925925926 | 49.918 |
| 0.6679166666666667 | 49.92 |
| 0.6679282407407406 | 49.921 |
| 0.6679398148148148 | 49.921 |
| 0.6679513888888889 | 49.925 |
| 0.667962962962963 | 49.927 |
| 0.667974537037037 | 49.929 |
| 0.6679861111111111 | 49.928 |
| 0.6679976851851852 | 49.93 |
| 0.6680092592592594 | 49.931 |
| 0.6680208333333333 | 49.933 |
| 0.6680324074074074 | 49.935 |
| 0.6680439814814815 | 49.935 |
| 0.6680555555555556 | 49.936 |
| 0.6680671296296296 | 49.937 |
| 0.6680787037037037 | 49.936 |
| 0.6680902777777779 | 49.936 |
| 0.6681018518518518 | 49.936 |
| 0.6681134259259259 | 49.936 |
| 0.668125 | 49.935 |
| 0.6681365740740741 | 49.936 |
| 0.668148148148148 | 49.935 |
| 0.6681597222222222 | 49.933 |
| 0.6681712962962963 | 49.931 |
| 0.6681828703703704 | 49.929 |
| 0.6681944444444444 | 49.928 |
| 0.6682060185185185 | 49.928 |
| 0.6682175925925926 | 49.93 |
| 0.6682291666666668 | 49.932 |
| 0.6682407407407407 | 49.933 |
| 0.6682523148148148 | 49.937 |
| 0.6682638888888889 | 49.94 |
| 0.668275462962963 | 49.943 |
| 0.668287037037037 | 49.945 |
| 0.6682986111111111 | 49.945 |
| 0.6683101851851853 | 49.947 |
| 0.6683217592592593 | 49.946 |
| 0.6683333333333333 | 49.947 |
| 0.6683449074074074 | 49.948 |
| 0.6683564814814815 | 49.948 |
| 0.6683680555555555 | 49.949 |
| 0.6683796296296296 | 49.949 |
| 0.6683912037037038 | 49.95 |
| 0.6684027777777778 | 49.948 |
| 0.6684143518518518 | 49.947 |
| 0.6684259259259259 | 49.946 |
| 0.6684375 | 49.947 |
| 0.6684490740740742 | 49.945 |
| 0.6684606481481481 | 49.944 |
| 0.6684722222222222 | 49.942 |
| 0.6684837962962963 | 49.942 |
| 0.6684953703703704 | 49.943 |
| 0.6685069444444444 | 49.944 |
| 0.6685185185185185 | 49.943 |
| 0.6685300925925927 | 49.943 |
| 0.6685416666666667 | 49.943 |
| 0.6685532407407407 | 49.943 |
| 0.6685648148148148 | 49.942 |
| 0.6685763888888889 | 49.941 |
| 0.6685879629629629 | 49.94 |
| 0.668599537037037 | 49.939 |
| 0.6686111111111112 | 49.937 |
| 0.6686226851851852 | 49.934 |
| 0.6686342592592592 | 49.932 |
| 0.6686458333333333 | 49.929 |
| 0.6686574074074074 | 49.927 |
| 0.6686689814814816 | 49.925 |
| 0.6686805555555555 | 49.923 |
| 0.6686921296296297 | 49.922 |
| 0.6687037037037037 | 49.92 |
| 0.6687152777777778 | 49.918 |
| 0.6687268518518518 | 49.917 |
| 0.6687384259259259 | 49.916 |
| 0.6687500000000001 | 49.915 |
| 0.6687615740740741 | 49.915 |
| 0.6687731481481481 | 49.914 |
| 0.6687847222222222 | 49.915 |
| 0.6687962962962963 | 49.917 |
| 0.6688078703703703 | 49.919 |
| 0.6688194444444444 | 49.921 |
| 0.6688310185185186 | 49.927 |
| 0.6688425925925926 | 49.932 |
| 0.6688541666666666 | 49.94 |
| 0.6688657407407407 | 49.946 |
| 0.6688773148148148 | 49.951 |
| 0.668888888888889 | 49.956 |
| 0.6689004629629629 | 49.958 |
| 0.668912037037037 | 49.959 |
| 0.6689236111111111 | 49.958 |
| 0.6689351851851852 | 49.958 |
| 0.6689467592592592 | 49.958 |
| 0.6689583333333333 | 49.959 |
| 0.6689699074074075 | 49.96 |
| 0.6689814814814815 | 49.961 |
| 0.6689930555555555 | 49.963 |
| 0.6690046296296296 | 49.965 |
| 0.6690162037037037 | 49.964 |
| 0.6690277777777779 | 49.963 |
| 0.6690393518518518 | 49.962 |
| 0.669050925925926 | 49.961 |
| 0.6690625 | 49.961 |
| 0.669074074074074 | 49.961 |
| 0.6690856481481481 | 49.962 |
| 0.6690972222222222 | 49.966 |
| 0.6691087962962964 | 49.967 |
| 0.6691203703703703 | 49.969 |
| 0.6691319444444445 | 49.967 |
| 0.6691435185185185 | 49.969 |
| 0.6691550925925926 | 49.969 |
| 0.6691666666666666 | 49.97 |
| 0.6691782407407407 | 49.967 |
| 0.6691898148148149 | 49.965 |
| 0.6692013888888889 | 49.963 |
| 0.669212962962963 | 49.96 |
| 0.669224537037037 | 49.955 |
| 0.6692361111111111 | 49.953 |
| 0.6692476851851853 | 49.949 |
| 0.6692592592592592 | 49.95 |
| 0.6692708333333334 | 49.952 |
| 0.6692824074074074 | 49.954 |
| 0.6692939814814814 | 49.953 |
| 0.6693055555555555 | 49.954 |
| 0.6693171296296296 | 49.956 |
| 0.6693287037037038 | 49.959 |
| 0.6693402777777777 | 49.959 |
| 0.6693518518518519 | 49.959 |
| 0.6693634259259259 | 49.96 |
| 0.669375 | 49.96 |
| 0.669386574074074 | 49.959 |
| 0.6693981481481481 | 49.96 |
| 0.6694097222222223 | 49.962 |
| 0.6694212962962963 | 49.96 |
| 0.6694328703703704 | 49.96 |
| 0.6694444444444444 | 49.961 |
| 0.6694560185185185 | 49.961 |
| 0.6694675925925927 | 49.96 |
| 0.6694791666666666 | 49.96 |
| 0.6694907407407408 | 49.96 |
| 0.6695023148148148 | 49.96 |
| 0.6695138888888889 | 49.962 |
| 0.6695254629629629 | 49.963 |
| 0.669537037037037 | 49.964 |
| 0.6695486111111112 | 49.967 |
| 0.6695601851851851 | 49.969 |
| 0.6695717592592593 | 49.97 |
| 0.6695833333333333 | 49.972 |
| 0.6695949074074075 | 49.975 |
| 0.6696064814814814 | 49.976 |
| 0.6696180555555555 | 49.98 |
| 0.6696296296296297 | 49.982 |
| 0.6696412037037037 | 49.984 |
| 0.6696527777777778 | 49.985 |
| 0.6696643518518518 | 49.984 |
| 0.669675925925926 | 49.984 |
| 0.6696875000000001 | 49.983 |
| 0.669699074074074 | 49.981 |
| 0.6697106481481482 | 49.98 |
| 0.6697222222222222 | 49.978 |
| 0.6697337962962964 | 49.976 |
| 0.6697453703703703 | 49.972 |
| 0.6697569444444444 | 49.968 |
| 0.6697685185185186 | 49.963 |
| 0.6697800925925925 | 49.962 |
| 0.6697916666666667 | 49.958 |
| 0.6698032407407407 | 49.954 |
| 0.6698148148148149 | 49.952 |
| 0.6698263888888888 | 49.951 |
| 0.6698379629629629 | 49.951 |
| 0.6698495370370371 | 49.951 |
| 0.6698611111111111 | 49.953 |
| 0.6698726851851852 | 49.955 |
| 0.6698842592592592 | 49.955 |
| 0.6698958333333334 | 49.956 |
| 0.6699074074074075 | 49.958 |
| 0.6699189814814814 | 49.957 |
| 0.6699305555555556 | 49.958 |
| 0.6699421296296296 | 49.959 |
| 0.6699537037037038 | 49.961 |
| 0.6699652777777777 | 49.963 |
| 0.6699768518518519 | 49.961 |
| 0.669988425925926 | 49.957 |
| 0.6699999999999999 | 49.955 |
| 0.6700115740740741 | 49.955 |
| 0.6700231481481481 | 49.955 |
| 0.6700347222222223 | 49.953 |
| 0.6700462962962962 | 49.951 |
| 0.6700578703703703 | 49.949 |
| 0.6700694444444445 | 49.946 |
| 0.6700810185185185 | 49.943 |
| 0.6700925925925926 | 49.94 |
| 0.6701041666666666 | 49.938 |
| 0.6701157407407408 | 49.935 |
| 0.6701273148148149 | 49.932 |
| 0.6701388888888888 | 49.929 |
| 0.670150462962963 | 49.926 |
| 0.670162037037037 | 49.924 |
| 0.6701736111111112 | 49.922 |
| 0.6701851851851851 | 49.921 |
| 0.6701967592592593 | 49.921 |
| 0.6702083333333334 | 49.919 |
| 0.6702199074074073 | 49.918 |
| 0.6702314814814815 | 49.919 |
| 0.6702430555555555 | 49.918 |
| 0.6702546296296297 | 49.919 |
| 0.6702662037037036 | 49.918 |
| 0.6702777777777778 | 49.917 |
| 0.6702893518518519 | 49.917 |
| 0.6703009259259259 | 49.914 |
| 0.6703125 | 49.913 |
| 0.670324074074074 | 49.909 |
| 0.6703356481481482 | 49.909 |
| 0.6703472222222223 | 49.908 |
| 0.6703587962962962 | 49.908 |
| 0.6703703703703704 | 49.907 |
| 0.6703819444444444 | 49.908 |
| 0.6703935185185186 | 49.908 |
| 0.6704050925925925 | 49.908 |
| 0.6704166666666667 | 49.91 |
| 0.6704282407407408 | 49.911 |
| 0.6704398148148148 | 49.912 |
| 0.6704513888888889 | 49.912 |
| 0.6704629629629629 | 49.91 |
| 0.6704745370370371 | 49.912 |
| 0.670486111111111 | 49.915 |
| 0.6704976851851852 | 49.914 |
| 0.6705092592592593 | 49.914 |
| 0.6705208333333333 | 49.916 |
| 0.6705324074074074 | 49.918 |
| 0.6705439814814814 | 49.919 |
| 0.6705555555555556 | 49.918 |
| 0.6705671296296297 | 49.917 |
| 0.6705787037037036 | 49.917 |
| 0.6705902777777778 | 49.917 |
| 0.6706018518518518 | 49.914 |
| 0.670613425925926 | 49.914 |
| 0.6706249999999999 | 49.913 |
| 0.6706365740740741 | 49.911 |
| 0.6706481481481482 | 49.909 |
| 0.6706597222222223 | 49.908 |
| 0.6706712962962963 | 49.907 |
| 0.6706828703703703 | 49.904 |
| 0.6706944444444445 | 49.901 |
| 0.6707060185185184 | 49.898 |
| 0.6707175925925926 | 49.897 |
| 0.6707291666666667 | 49.896 |
| 0.6707407407407407 | 49.895 |
| 0.6707523148148148 | 49.894 |
| 0.6707638888888888 | 49.897 |
| 0.670775462962963 | 49.897 |
| 0.6707870370370371 | 49.897 |
| 0.670798611111111 | 49.898 |
| 0.6708101851851852 | 49.898 |
| 0.6708217592592592 | 49.898 |
| 0.6708333333333334 | 49.897 |
| 0.6708449074074073 | 49.894 |
| 0.6708564814814815 | 49.891 |
| 0.6708680555555556 | 49.888 |
| 0.6708796296296297 | 49.887 |
| 0.6708912037037037 | 49.885 |
| 0.6709027777777777 | 49.887 |
| 0.6709143518518519 | 49.89 |
| 0.670925925925926 | 49.893 |
| 0.6709375 | 49.896 |
| 0.6709490740740741 | 49.9 |
| 0.6709606481481482 | 49.903 |
| 0.6709722222222222 | 49.906 |
| 0.6709837962962962 | 49.908 |
| 0.6709953703703704 | 49.909 |
| 0.6710069444444445 | 49.913 |
| 0.6710185185185185 | 49.917 |
| 0.6710300925925926 | 49.92 |
| 0.6710416666666666 | 49.92 |
| 0.6710532407407408 | 49.921 |
| 0.6710648148148147 | 49.924 |
| 0.6710763888888889 | 49.924 |
| 0.671087962962963 | 49.925 |
| 0.6710995370370371 | 49.926 |
| 0.6711111111111111 | 49.925 |
| 0.6711226851851851 | 49.925 |
| 0.6711342592592593 | 49.926 |
| 0.6711458333333334 | 49.928 |
| 0.6711574074074074 | 49.928 |
| 0.6711689814814815 | 49.927 |
| 0.6711805555555556 | 49.927 |
| 0.6711921296296296 | 49.927 |
| 0.6712037037037036 | 49.926 |
| 0.6712152777777778 | 49.926 |
| 0.6712268518518519 | 49.926 |
| 0.6712384259259259 | 49.925 |
| 0.67125 | 49.924 |
| 0.671261574074074 | 49.923 |
| 0.6712731481481482 | 49.921 |
| 0.6712847222222221 | 49.923 |
| 0.6712962962962963 | 49.924 |
| 0.6713078703703704 | 49.923 |
| 0.6713194444444445 | 49.923 |
| 0.6713310185185185 | 49.925 |
| 0.6713425925925925 | 49.923 |
| 0.6713541666666667 | 49.923 |
| 0.6713657407407408 | 49.925 |
| 0.6713773148148148 | 49.926 |
| 0.6713888888888889 | 49.928 |
| 0.671400462962963 | 49.927 |
| 0.671412037037037 | 49.929 |
| 0.671423611111111 | 49.929 |
| 0.6714351851851852 | 49.931 |
| 0.6714467592592593 | 49.932 |
| 0.6714583333333333 | 49.933 |
| 0.6714699074074074 | 49.934 |
| 0.6714814814814815 | 49.935 |
| 0.6714930555555556 | 49.933 |
| 0.6715046296296295 | 49.933 |
| 0.6715162037037037 | 49.931 |
| 0.6715277777777778 | 49.932 |
| 0.6715393518518519 | 49.933 |
| 0.6715509259259259 | 49.931 |
| 0.6715625 | 49.932 |
| 0.6715740740740741 | 49.932 |
| 0.6715856481481483 | 49.931 |
| 0.6715972222222222 | 49.928 |
| 0.6716087962962963 | 49.928 |
| 0.6716203703703704 | 49.925 |
| 0.6716319444444445 | 49.926 |
| 0.6716435185185184 | 49.925 |
| 0.6716550925925926 | 49.925 |
| 0.6716666666666667 | 49.922 |
| 0.6716782407407407 | 49.918 |
| 0.6716898148148148 | 49.916 |
| 0.6717013888888889 | 49.913 |
| 0.671712962962963 | 49.912 |
| 0.6717245370370369 | 49.909 |
| 0.6717361111111111 | 49.908 |
| 0.6717476851851852 | 49.909 |
| 0.6717592592592593 | 49.908 |
| 0.6717708333333333 | 49.908 |
| 0.6717824074074074 | 49.909 |
| 0.6717939814814815 | 49.908 |
| 0.6718055555555557 | 49.91 |
| 0.6718171296296296 | 49.909 |
| 0.6718287037037037 | 49.911 |
| 0.6718402777777778 | 49.91 |
| 0.6718518518518519 | 49.91 |
| 0.6718634259259259 | 49.912 |
| 0.671875 | 49.913 |
| 0.6718865740740741 | 49.912 |
| 0.6718981481481481 | 49.911 |
| 0.6719097222222222 | 49.91 |
| 0.6719212962962963 | 49.91 |
| 0.6719328703703704 | 49.91 |
| 0.6719444444444443 | 49.909 |
| 0.6719560185185185 | 49.906 |
| 0.6719675925925926 | 49.905 |
| 0.6719791666666667 | 49.904 |
| 0.6719907407407407 | 49.903 |
| 0.6720023148148148 | 49.902 |
| 0.6720138888888889 | 49.898 |
| 0.6720254629629631 | 49.894 |
| 0.672037037037037 | 49.893 |
| 0.6720486111111111 | 49.893 |
| 0.6720601851851852 | 49.897 |
| 0.6720717592592593 | 49.902 |
| 0.6720833333333333 | 49.905 |
| 0.6720949074074074 | 49.908 |
| 0.6721064814814816 | 49.91 |
| 0.6721180555555555 | 49.913 |
| 0.6721296296296296 | 49.917 |
| 0.6721412037037037 | 49.914 |
| 0.6721527777777778 | 49.912 |
| 0.6721643518518517 | 49.91 |
| 0.6721759259259259 | 49.907 |
| 0.6721875 | 49.903 |
| 0.6721990740740741 | 49.9 |
| 0.6722106481481481 | 49.899 |
| 0.6722222222222222 | 49.898 |
| 0.6722337962962963 | 49.898 |
| 0.6722453703703705 | 49.899 |
| 0.6722569444444444 | 49.9 |
| 0.6722685185185185 | 49.903 |
| 0.6722800925925926 | 49.904 |
| 0.6722916666666667 | 49.905 |
| 0.6723032407407407 | 49.908 |
| 0.6723148148148148 | 49.909 |
| 0.672326388888889 | 49.909 |
| 0.672337962962963 | 49.909 |
| 0.672349537037037 | 49.91 |
| 0.6723611111111111 | 49.911 |
| 0.6723726851851852 | 49.912 |
| 0.6723842592592592 | 49.913 |
| 0.6723958333333333 | 49.916 |
| 0.6724074074074075 | 49.917 |
| 0.6724189814814815 | 49.918 |
| 0.6724305555555555 | 49.916 |
| 0.6724421296296296 | 49.917 |
| 0.6724537037037037 | 49.916 |
| 0.6724652777777779 | 49.916 |
| 0.6724768518518518 | 49.914 |
| 0.672488425925926 | 49.912 |
| 0.6725 | 49.909 |
| 0.6725115740740741 | 49.908 |
| 0.6725231481481481 | 49.908 |
| 0.6725347222222222 | 49.91 |
| 0.6725462962962964 | 49.913 |
| 0.6725578703703704 | 49.914 |
| 0.6725694444444444 | 49.917 |
| 0.6725810185185185 | 49.919 |
| 0.6725925925925926 | 49.922 |
| 0.6726041666666666 | 49.924 |
| 0.6726157407407407 | 49.928 |
| 0.6726273148148149 | 49.929 |
| 0.6726388888888889 | 49.93 |
| 0.6726504629629629 | 49.931 |
| 0.672662037037037 | 49.932 |
| 0.6726736111111111 | 49.933 |
| 0.6726851851851853 | 49.935 |
| 0.6726967592592592 | 49.934 |
| 0.6727083333333334 | 49.933 |
| 0.6727199074074074 | 49.934 |
| 0.6727314814814815 | 49.934 |
| 0.6727430555555555 | 49.935 |
| 0.6727546296296296 | 49.935 |
| 0.6727662037037038 | 49.935 |
| 0.6727777777777778 | 49.935 |
| 0.6727893518518518 | 49.935 |
| 0.6728009259259259 | 49.936 |
| 0.6728125 | 49.936 |
| 0.672824074074074 | 49.936 |
| 0.6728356481481481 | 49.933 |
| 0.6728472222222223 | 49.932 |
| 0.6728587962962963 | 49.93 |
| 0.6728703703703703 | 49.928 |
| 0.6728819444444444 | 49.926 |
| 0.6728935185185185 | 49.922 |
| 0.6729050925925927 | 49.92 |
| 0.6729166666666666 | 49.917 |
| 0.6729282407407408 | 49.914 |
| 0.6729398148148148 | 49.914 |
| 0.672951388888889 | 49.912 |
| 0.6729629629629629 | 49.913 |
| 0.672974537037037 | 49.914 |
| 0.6729861111111112 | 49.913 |
| 0.6729976851851852 | 49.913 |
| 0.6730092592592593 | 49.913 |
| 0.6730208333333333 | 49.915 |
| 0.6730324074074074 | 49.914 |
| 0.6730439814814816 | 49.914 |
| 0.6730555555555555 | 49.911 |
| 0.6730671296296297 | 49.909 |
| 0.6730787037037037 | 49.908 |
| 0.6730902777777777 | 49.906 |
| 0.6731018518518518 | 49.905 |
| 0.6731134259259259 | 49.905 |
| 0.6731250000000001 | 49.905 |
| 0.673136574074074 | 49.902 |
| 0.6731481481481482 | 49.9 |
| 0.6731597222222222 | 49.9 |
| 0.6731712962962964 | 49.898 |
| 0.6731828703703703 | 49.898 |
| 0.6731944444444444 | 49.899 |
| 0.6732060185185186 | 49.899 |
| 0.6732175925925926 | 49.9 |
| 0.6732291666666667 | 49.901 |
| 0.6732407407407407 | 49.902 |
| 0.6732523148148148 | 49.903 |
| 0.673263888888889 | 49.904 |
| 0.6732754629629629 | 49.904 |
| 0.6732870370370371 | 49.905 |
| 0.6732986111111111 | 49.905 |
| 0.6733101851851852 | 49.906 |
| 0.6733217592592592 | 49.907 |
| 0.6733333333333333 | 49.907 |
| 0.6733449074074075 | 49.906 |
| 0.6733564814814814 | 49.907 |
| 0.6733680555555556 | 49.906 |
| 0.6733796296296296 | 49.906 |
| 0.6733912037037038 | 49.906 |
| 0.6734027777777777 | 49.905 |
| 0.6734143518518518 | 49.904 |
| 0.673425925925926 | 49.903 |
| 0.6734375 | 49.901 |
| 0.6734490740740741 | 49.899 |
| 0.6734606481481481 | 49.896 |
| 0.6734722222222222 | 49.895 |
| 0.6734837962962964 | 49.893 |
| 0.6734953703703703 | 49.89 |
| 0.6735069444444445 | 49.889 |
| 0.6735185185185185 | 49.887 |
| 0.6735300925925927 | 49.885 |
| 0.6735416666666666 | 49.885 |
| 0.6735532407407407 | 49.884 |
| 0.6735648148148149 | 49.881 |
| 0.6735763888888888 | 49.88 |
| 0.673587962962963 | 49.88 |
| 0.673599537037037 | 49.881 |
| 0.6736111111111112 | 49.884 |
| 0.6736226851851851 | 49.884 |
| 0.6736342592592592 | 49.884 |
| 0.6736458333333334 | 49.884 |
| 0.6736574074074074 | 49.884 |
| 0.6736689814814815 | 49.884 |
| 0.6736805555555555 | 49.884 |
| 0.6736921296296297 | 49.882 |
| 0.6737037037037038 | 49.881 |
| 0.6737152777777777 | 49.878 |
| 0.6737268518518519 | 49.877 |
| 0.6737384259259259 | 49.875 |
| 0.6737500000000001 | 49.873 |
| 0.673761574074074 | 49.872 |
| 0.6737731481481481 | 49.873 |
| 0.6737847222222223 | 49.873 |
| 0.6737962962962962 | 49.873 |
| 0.6738078703703704 | 49.872 |
| 0.6738194444444444 | 49.872 |
| 0.6738310185185186 | 49.873 |
| 0.6738425925925925 | 49.871 |
| 0.6738541666666666 | 49.869 |
| 0.6738657407407408 | 49.867 |
| 0.6738773148148148 | 49.869 |
| 0.6738888888888889 | 49.87 |
| 0.6739004629629629 | 49.871 |
| 0.6739120370370371 | 49.872 |
| 0.6739236111111112 | 49.872 |
| 0.6739351851851851 | 49.871 |
| 0.6739467592592593 | 49.871 |
| 0.6739583333333333 | 49.87 |
| 0.6739699074074075 | 49.868 |
| 0.6739814814814814 | 49.868 |
| 0.6739930555555556 | 49.866 |
| 0.6740046296296297 | 49.866 |
| 0.6740162037037036 | 49.867 |
| 0.6740277777777778 | 49.869 |
| 0.6740393518518518 | 49.87 |
| 0.674050925925926 | 49.872 |
| 0.6740624999999999 | 49.873 |
| 0.674074074074074 | 49.875 |
| 0.6740856481481482 | 49.876 |
| 0.6740972222222222 | 49.875 |
| 0.6741087962962963 | 49.874 |
| 0.6741203703703703 | 49.875 |
| 0.6741319444444445 | 49.873 |
| 0.6741435185185186 | 49.873 |
| 0.6741550925925925 | 49.876 |
| 0.6741666666666667 | 49.876 |
| 0.6741782407407407 | 49.877 |
| 0.6741898148148149 | 49.879 |
| 0.6742013888888888 | 49.879 |
| 0.674212962962963 | 49.878 |
| 0.6742245370370371 | 49.88 |
| 0.6742361111111111 | 49.879 |
| 0.6742476851851852 | 49.88 |
| 0.6742592592592592 | 49.878 |
| 0.6742708333333334 | 49.877 |
| 0.6742824074074073 | 49.875 |
| 0.6742939814814815 | 49.873 |
| 0.6743055555555556 | 49.871 |
| 0.6743171296296296 | 49.871 |
| 0.6743287037037037 | 49.872 |
| 0.6743402777777777 | 49.871 |
| 0.6743518518518519 | 49.87 |
| 0.674363425925926 | 49.87 |
| 0.674375 | 49.868 |
| 0.6743865740740741 | 49.866 |
| 0.6743981481481481 | 49.865 |
| 0.6744097222222223 | 49.862 |
| 0.6744212962962962 | 49.859 |
| 0.6744328703703704 | 49.859 |
| 0.6744444444444445 | 49.857 |
| 0.6744560185185186 | 49.858 |
| 0.6744675925925926 | 49.859 |
| 0.6744791666666666 | 49.862 |
| 0.6744907407407408 | 49.865 |
| 0.6745023148148147 | 49.869 |
| 0.6745138888888889 | 49.873 |
| 0.674525462962963 | 49.876 |
| 0.674537037037037 | 49.879 |
| 0.6745486111111111 | 49.882 |
| 0.6745601851851851 | 49.884 |
| 0.6745717592592593 | 49.885 |
| 0.6745833333333334 | 49.887 |
| 0.6745949074074074 | 49.886 |
| 0.6746064814814815 | 49.887 |
| 0.6746180555555555 | 49.884 |
| 0.6746296296296297 | 49.886 |
| 0.6746412037037036 | 49.886 |
| 0.6746527777777778 | 49.887 |
| 0.6746643518518519 | 49.889 |
| 0.674675925925926 | 49.888 |
| 0.6746875 | 49.886 |
| 0.674699074074074 | 49.884 |
| 0.6747106481481482 | 49.884 |
| 0.6747222222222221 | 49.882 |
| 0.6747337962962963 | 49.88 |
| 0.6747453703703704 | 49.881 |
| 0.6747569444444445 | 49.88 |
| 0.6747685185185185 | 49.881 |
| 0.6747800925925925 | 49.881 |
| 0.6747916666666667 | 49.882 |
| 0.6748032407407408 | 49.884 |
| 0.6748148148148148 | 49.884 |
| 0.6748263888888889 | 49.884 |
| 0.674837962962963 | 49.886 |
| 0.6748495370370371 | 49.883 |
| 0.674861111111111 | 49.884 |
| 0.6748726851851852 | 49.883 |
| 0.6748842592592593 | 49.882 |
| 0.6748958333333334 | 49.88 |
| 0.6749074074074074 | 49.879 |
| 0.6749189814814814 | 49.878 |
| 0.6749305555555556 | 49.877 |
| 0.6749421296296297 | 49.876 |
| 0.6749537037037037 | 49.876 |
| 0.6749652777777778 | 49.876 |
| 0.6749768518518519 | 49.877 |
| 0.6749884259259259 | 49.877 |
| 0.6749999999999999 | 49.878 |
| 0.6750115740740741 | 49.876 |
| 0.6750231481481482 | 49.876 |
| 0.6750347222222222 | 49.876 |
| 0.6750462962962963 | 49.876 |
| 0.6750578703703703 | 49.874 |
| 0.6750694444444445 | 49.873 |
| 0.6750810185185184 | 49.873 |
| 0.6750925925925926 | 49.871 |
| 0.6751041666666667 | 49.87 |
| 0.6751157407407408 | 49.868 |
| 0.6751273148148148 | 49.867 |
| 0.6751388888888888 | 49.865 |
| 0.675150462962963 | 49.861 |
| 0.6751620370370371 | 49.859 |
| 0.6751736111111111 | 49.858 |
| 0.6751851851851852 | 49.858 |
| 0.6751967592592593 | 49.858 |
| 0.6752083333333333 | 49.86 |
| 0.6752199074074073 | 49.862 |
| 0.6752314814814815 | 49.862 |
| 0.6752430555555556 | 49.862 |
| 0.6752546296296296 | 49.86 |
| 0.6752662037037037 | 49.859 |
| 0.6752777777777778 | 49.857 |
| 0.6752893518518519 | 49.854 |
| 0.6753009259259258 | 49.853 |
| 0.6753125 | 49.851 |
| 0.6753240740740741 | 49.852 |
| 0.6753356481481482 | 49.851 |
| 0.6753472222222222 | 49.854 |
| 0.6753587962962962 | 49.855 |
| 0.6753703703703704 | 49.856 |
| 0.6753819444444445 | 49.857 |
| 0.6753935185185185 | 49.856 |
| 0.6754050925925926 | 49.858 |
| 0.6754166666666667 | 49.86 |
| 0.6754282407407407 | 49.862 |
| 0.6754398148148147 | 49.864 |
| 0.6754513888888889 | 49.867 |
| 0.675462962962963 | 49.87 |
| 0.675474537037037 | 49.873 |
| 0.6754861111111111 | 49.875 |
| 0.6754976851851852 | 49.878 |
| 0.6755092592592593 | 49.878 |
| 0.6755208333333332 | 49.879 |
| 0.6755324074074074 | 49.879 |
| 0.6755439814814815 | 49.88 |
| 0.6755555555555556 | 49.88 |
| 0.6755671296296296 | 49.88 |
| 0.6755787037037037 | 49.879 |
| 0.6755902777777778 | 49.881 |
| 0.675601851851852 | 49.882 |
| 0.6756134259259259 | 49.882 |
| 0.675625 | 49.881 |
| 0.6756365740740741 | 49.884 |
| 0.6756481481481482 | 49.883 |
| 0.6756597222222221 | 49.887 |
| 0.6756712962962963 | 49.889 |
| 0.6756828703703704 | 49.891 |
| 0.6756944444444444 | 49.891 |
| 0.6757060185185185 | 49.89 |
| 0.6757175925925926 | 49.891 |
| 0.6757291666666667 | 49.89 |
| 0.6757407407407406 | 49.887 |
| 0.6757523148148148 | 49.883 |
| 0.6757638888888889 | 49.884 |
| 0.675775462962963 | 49.883 |
| 0.675787037037037 | 49.881 |
| 0.6757986111111111 | 49.879 |
| 0.6758101851851852 | 49.878 |
| 0.6758217592592594 | 49.878 |
| 0.6758333333333333 | 49.877 |
| 0.6758449074074074 | 49.877 |
| 0.6758564814814815 | 49.876 |
| 0.6758680555555556 | 49.875 |
| 0.6758796296296296 | 49.874 |
| 0.6758912037037037 | 49.875 |
| 0.6759027777777779 | 49.876 |
| 0.6759143518518518 | 49.877 |
| 0.6759259259259259 | 49.878 |
| 0.6759375 | 49.882 |
| 0.6759490740740741 | 49.884 |
| 0.675960648148148 | 49.887 |
| 0.6759722222222222 | 49.89 |
| 0.6759837962962963 | 49.892 |
| 0.6759953703703704 | 49.895 |
| 0.6760069444444444 | 49.897 |
| 0.6760185185185185 | 49.899 |
| 0.6760300925925926 | 49.902 |
| 0.6760416666666668 | 49.902 |
| 0.6760532407407407 | 49.905 |
| 0.6760648148148148 | 49.904 |
| 0.6760763888888889 | 49.904 |
| 0.676087962962963 | 49.905 |
| 0.676099537037037 | 49.904 |
| 0.6761111111111111 | 49.904 |
| 0.6761226851851853 | 49.906 |
| 0.6761342592592593 | 49.907 |
| 0.6761458333333333 | 49.907 |
| 0.6761574074074074 | 49.908 |
| 0.6761689814814815 | 49.909 |
| 0.6761805555555555 | 49.912 |
| 0.6761921296296296 | 49.914 |
| 0.6762037037037038 | 49.916 |
| 0.6762152777777778 | 49.917 |
| 0.6762268518518518 | 49.92 |
| 0.6762384259259259 | 49.922 |
| 0.67625 | 49.925 |
| 0.6762615740740742 | 49.927 |
| 0.6762731481481481 | 49.93 |
| 0.6762847222222222 | 49.932 |
| 0.6762962962962963 | 49.932 |
| 0.6763078703703704 | 49.932 |
| 0.6763194444444444 | 49.931 |
| 0.6763310185185185 | 49.93 |
| 0.6763425925925927 | 49.927 |
| 0.6763541666666667 | 49.926 |
| 0.6763657407407407 | 49.925 |
| 0.6763773148148148 | 49.923 |
| 0.6763888888888889 | 49.922 |
| 0.6764004629629629 | 49.92 |
| 0.676412037037037 | 49.918 |
| 0.6764236111111112 | 49.916 |
| 0.6764351851851852 | 49.91 |
| 0.6764467592592592 | 49.909 |
| 0.6764583333333333 | 49.907 |
| 0.6764699074074074 | 49.903 |
| 0.6764814814814816 | 49.902 |
| 0.6764930555555555 | 49.9 |
| 0.6765046296296297 | 49.899 |
| 0.6765162037037037 | 49.9 |
| 0.6765277777777778 | 49.898 |
| 0.6765393518518518 | 49.899 |
| 0.6765509259259259 | 49.898 |
| 0.6765625000000001 | 49.899 |
| 0.6765740740740741 | 49.899 |
| 0.6765856481481481 | 49.899 |
| 0.6765972222222222 | 49.899 |
| 0.6766087962962963 | 49.901 |
| 0.6766203703703703 | 49.901 |
| 0.6766319444444444 | 49.903 |
| 0.6766435185185186 | 49.902 |
| 0.6766550925925926 | 49.904 |
| 0.6766666666666666 | 49.905 |
| 0.6766782407407407 | 49.907 |
| 0.6766898148148148 | 49.909 |
| 0.676701388888889 | 49.909 |
| 0.6767129629629629 | 49.91 |
| 0.676724537037037 | 49.91 |
| 0.6767361111111111 | 49.909 |
| 0.6767476851851852 | 49.909 |
| 0.6767592592592592 | 49.907 |
| 0.6767708333333333 | 49.907 |
| 0.6767824074074075 | 49.907 |
| 0.6767939814814815 | 49.906 |
| 0.6768055555555555 | 49.906 |
| 0.6768171296296296 | 49.905 |
| 0.6768287037037037 | 49.905 |
| 0.6768402777777779 | 49.904 |
| 0.6768518518518518 | 49.903 |
| 0.676863425925926 | 49.902 |
| 0.676875 | 49.901 |
| 0.676886574074074 | 49.899 |
| 0.6768981481481481 | 49.9 |
| 0.6769097222222222 | 49.901 |
| 0.6769212962962964 | 49.902 |
| 0.6769328703703703 | 49.902 |
| 0.6769444444444445 | 49.903 |
| 0.6769560185185185 | 49.903 |
| 0.6769675925925926 | 49.903 |
| 0.6769791666666666 | 49.903 |
| 0.6769907407407407 | 49.903 |
| 0.6770023148148149 | 49.903 |
| 0.6770138888888889 | 49.902 |
| 0.677025462962963 | 49.9 |
| 0.677037037037037 | 49.898 |
| 0.6770486111111111 | 49.897 |
| 0.6770601851851853 | 49.896 |
| 0.6770717592592592 | 49.894 |
| 0.6770833333333334 | 49.894 |
| 0.6770949074074074 | 49.893 |
| 0.6771064814814814 | 49.894 |
| 0.6771180555555555 | 49.895 |
| 0.6771296296296296 | 49.894 |
| 0.6771412037037038 | 49.895 |
| 0.6771527777777777 | 49.895 |
| 0.6771643518518519 | 49.896 |
| 0.6771759259259259 | 49.898 |
| 0.6771875 | 49.899 |
| 0.677199074074074 | 49.902 |
| 0.6772106481481481 | 49.903 |
| 0.6772222222222223 | 49.906 |
| 0.6772337962962963 | 49.908 |
| 0.6772453703703704 | 49.91 |
| 0.6772569444444444 | 49.91 |
| 0.6772685185185185 | 49.911 |
| 0.6772800925925927 | 49.911 |
| 0.6772916666666666 | 49.91 |
| 0.6773032407407408 | 49.91 |
| 0.6773148148148148 | 49.909 |
| 0.6773263888888889 | 49.908 |
| 0.6773379629629629 | 49.907 |
| 0.677349537037037 | 49.904 |
| 0.6773611111111112 | 49.901 |
| 0.6773726851851851 | 49.897 |
| 0.6773842592592593 | 49.894 |
| 0.6773958333333333 | 49.89 |
| 0.6774074074074075 | 49.889 |
| 0.6774189814814814 | 49.888 |
| 0.6774305555555555 | 49.888 |
| 0.6774421296296297 | 49.887 |
| 0.6774537037037037 | 49.886 |
| 0.6774652777777778 | 49.885 |
| 0.6774768518518518 | 49.883 |
| 0.677488425925926 | 49.88 |
| 0.6775000000000001 | 49.878 |
| 0.677511574074074 | 49.874 |
| 0.6775231481481482 | 49.87 |
| 0.6775347222222222 | 49.867 |
| 0.6775462962962964 | 49.867 |
| 0.6775578703703703 | 49.866 |
| 0.6775694444444444 | 49.865 |
| 0.6775810185185186 | 49.861 |
| 0.6775925925925925 | 49.859 |
| 0.6776041666666667 | 49.858 |
| 0.6776157407407407 | 49.857 |
| 0.6776273148148149 | 49.857 |
| 0.6776388888888888 | 49.857 |
| 0.6776504629629629 | 49.855 |
| 0.6776620370370371 | 49.853 |
| 0.6776736111111111 | 49.85 |
| 0.6776851851851852 | 49.848 |
| 0.6776967592592592 | 49.846 |
| 0.6777083333333334 | 49.845 |
| 0.6777199074074075 | 49.846 |
| 0.6777314814814814 | 49.848 |
| 0.6777430555555556 | 49.849 |
| 0.6777546296296296 | 49.85 |
| 0.6777662037037038 | 49.851 |
| 0.6777777777777777 | 49.855 |
| 0.6777893518518519 | 49.857 |
| 0.677800925925926 | 49.859 |
| 0.6778124999999999 | 49.862 |
| 0.6778240740740741 | 49.865 |
| 0.6778356481481481 | 49.868 |
| 0.6778472222222223 | 49.87 |
| 0.6778587962962962 | 49.872 |
| 0.6778703703703703 | 49.874 |
| 0.6778819444444445 | 49.877 |
| 0.6778935185185185 | 49.881 |
| 0.6779050925925926 | 49.885 |
| 0.6779166666666666 | 49.891 |
| 0.6779282407407408 | 49.896 |
| 0.6779398148148149 | 49.902 |
| 0.6779513888888888 | 49.909 |
| 0.677962962962963 | 49.915 |
| 0.677974537037037 | 49.92 |
| 0.6779861111111112 | 49.927 |
| 0.6779976851851851 | 49.931 |
| 0.6780092592592593 | 49.939 |
| 0.6780208333333334 | 49.944 |
| 0.6780324074074073 | 49.948 |
| 0.6780439814814815 | 49.952 |
| 0.6780555555555555 | 49.955 |
| 0.6780671296296297 | 49.961 |
| 0.6780787037037036 | 49.966 |
| 0.6780902777777778 | 49.973 |
| 0.6781018518518519 | 49.978 |
| 0.6781134259259259 | 49.984 |
| 0.678125 | 49.986 |
| 0.678136574074074 | 49.989 |
| 0.6781481481481482 | 49.993 |
| 0.6781597222222223 | 49.994 |
| 0.6781712962962962 | 49.996 |
| 0.6781828703703704 | 49.996 |
| 0.6781944444444444 | 49.996 |
| 0.6782060185185186 | 49.997 |
| 0.6782175925925925 | 49.999 |
| 0.6782291666666667 | 49.999 |
| 0.6782407407407408 | 50.001 |
| 0.6782523148148148 | 50.001 |
| 0.6782638888888889 | 50.002 |
| 0.6782754629629629 | 50.002 |
| 0.6782870370370371 | 50.003 |
| 0.678298611111111 | 50.002 |
| 0.6783101851851852 | 50.002 |
| 0.6783217592592593 | 50 |
| 0.6783333333333333 | 50.001 |
| 0.6783449074074074 | 50.001 |
| 0.6783564814814814 | 50.001 |
| 0.6783680555555556 | 50 |
| 0.6783796296296297 | 50.001 |
| 0.6783912037037036 | 50.001 |
| 0.6784027777777778 | 50 |
| 0.6784143518518518 | 50 |
| 0.678425925925926 | 49.999 |
| 0.6784374999999999 | 49.999 |
| 0.6784490740740741 | 49.998 |
| 0.6784606481481482 | 49.996 |
| 0.6784722222222223 | 49.994 |
| 0.6784837962962963 | 49.994 |
| 0.6784953703703703 | 49.992 |
| 0.6785069444444445 | 49.993 |
| 0.6785185185185184 | 49.992 |
| 0.6785300925925926 | 49.993 |
| 0.6785416666666667 | 49.992 |
| 0.6785532407407407 | 49.993 |
| 0.6785648148148148 | 49.995 |
| 0.6785763888888888 | 49.995 |
| 0.678587962962963 | 49.996 |
| 0.6785995370370371 | 49.995 |
| 0.678611111111111 | 49.995 |
| 0.6786226851851852 | 49.994 |
| 0.6786342592592592 | 49.993 |
| 0.6786458333333334 | 49.993 |
| 0.6786574074074073 | 49.994 |
| 0.6786689814814815 | 49.995 |
| 0.6786805555555556 | 49.995 |
| 0.6786921296296297 | 49.997 |
| 0.6787037037037037 | 49.999 |
| 0.6787152777777777 | 50.001 |
| 0.6787268518518519 | 50.003 |
| 0.678738425925926 | 50.005 |
| 0.67875 | 50.007 |
| 0.6787615740740741 | 50.008 |
| 0.6787731481481482 | 50.008 |
| 0.6787847222222222 | 50.009 |
| 0.6787962962962962 | 50.008 |
| 0.6788078703703704 | 50.007 |
| 0.6788194444444445 | 50.009 |
| 0.6788310185185185 | 50.011 |
| 0.6788425925925926 | 50.012 |
| 0.6788541666666666 | 50.012 |
| 0.6788657407407408 | 50.012 |
| 0.6788773148148147 | 50.01 |
| 0.6788888888888889 | 50.011 |
| 0.678900462962963 | 50.009 |
| 0.6789120370370371 | 50.007 |
| 0.6789236111111111 | 50.005 |
| 0.6789351851851851 | 50.002 |
| 0.6789467592592593 | 50.002 |
| 0.6789583333333334 | 49.998 |
| 0.6789699074074074 | 49.997 |
| 0.6789814814814815 | 49.994 |
| 0.6789930555555556 | 49.994 |
| 0.6790046296296296 | 49.993 |
| 0.6790162037037036 | 49.993 |
| 0.6790277777777778 | 49.993 |
| 0.6790393518518519 | 49.994 |
| 0.6790509259259259 | 49.993 |
| 0.6790625 | 49.994 |
| 0.679074074074074 | 49.994 |
| 0.6790856481481482 | 49.996 |
| 0.6790972222222221 | 49.996 |
| 0.6791087962962963 | 49.996 |
| 0.6791203703703704 | 49.996 |
| 0.6791319444444445 | 49.997 |
| 0.6791435185185185 | 49.995 |
| 0.6791550925925925 | 49.995 |